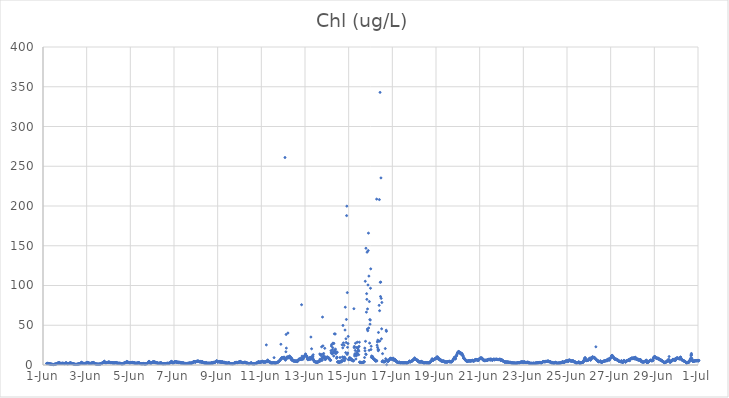
| Category | Chl (ug/L) |
|---|---|
| 45078.166666666664 | 1.92 |
| 45078.177083333336 | 1.88 |
| 45078.1875 | 1.85 |
| 45078.197916666664 | 1.78 |
| 45078.208333333336 | 1.95 |
| 45078.21875 | 2.26 |
| 45078.229166666664 | 2.01 |
| 45078.239583333336 | 1.95 |
| 45078.25 | 1.9 |
| 45078.260416666664 | 1.67 |
| 45078.270833333336 | 1.57 |
| 45078.28125 | 1.68 |
| 45078.291666666664 | 1.63 |
| 45078.302083333336 | 1.5 |
| 45078.3125 | 1.34 |
| 45078.322916666664 | 1.39 |
| 45078.333333333336 | 1.36 |
| 45078.34375 | 1.21 |
| 45078.354166666664 | 1.11 |
| 45078.364583333336 | 1.07 |
| 45078.375 | 1.02 |
| 45078.385416666664 | 0.97 |
| 45078.395833333336 | 1.02 |
| 45078.40625 | 0.93 |
| 45078.416666666664 | 0.81 |
| 45078.427083333336 | 0.87 |
| 45078.4375 | 0.68 |
| 45078.447916666664 | 0.64 |
| 45078.458333333336 | 0.58 |
| 45078.46875 | 0.56 |
| 45078.479166666664 | 0.51 |
| 45078.489583333336 | 0.64 |
| 45078.5 | 0.67 |
| 45078.510416666664 | 0.71 |
| 45078.520833333336 | 0.94 |
| 45078.53125 | 0.92 |
| 45078.541666666664 | 0.87 |
| 45078.552083333336 | 1.13 |
| 45078.5625 | 1.05 |
| 45078.572916666664 | 1 |
| 45078.583333333336 | 1.2 |
| 45078.59375 | 1.32 |
| 45078.604166666664 | 1.41 |
| 45078.614583333336 | 1.71 |
| 45078.625 | 1.72 |
| 45078.635416666664 | 1.81 |
| 45078.645833333336 | 1.87 |
| 45078.65625 | 2.12 |
| 45078.666666666664 | 2.24 |
| 45078.677083333336 | 2.17 |
| 45078.6875 | 2.4 |
| 45078.697916666664 | 2.45 |
| 45078.708333333336 | 2.29 |
| 45078.71875 | 2.29 |
| 45078.729166666664 | 2.85 |
| 45078.739583333336 | 3.1 |
| 45078.75 | 2.45 |
| 45078.760416666664 | 2.2 |
| 45078.770833333336 | 2.09 |
| 45078.78125 | 2.15 |
| 45078.791666666664 | 1.99 |
| 45078.802083333336 | 2.11 |
| 45078.8125 | 2.1 |
| 45078.822916666664 | 2.13 |
| 45078.833333333336 | 2.06 |
| 45078.84375 | 1.96 |
| 45078.854166666664 | 1.96 |
| 45078.864583333336 | 2.07 |
| 45078.875 | 2.08 |
| 45078.885416666664 | 2.19 |
| 45078.895833333336 | 2.27 |
| 45078.90625 | 2.01 |
| 45078.916666666664 | 2.1 |
| 45078.927083333336 | 1.97 |
| 45078.9375 | 2.05 |
| 45078.947916666664 | 1.94 |
| 45078.958333333336 | 2.01 |
| 45078.96875 | 1.93 |
| 45078.979166666664 | 1.87 |
| 45078.989583333336 | 1.82 |
| 45079.0 | 1.52 |
| 45079.010416666664 | 1.67 |
| 45079.020833333336 | 2.42 |
| 45079.03125 | 2.4 |
| 45079.041666666664 | 2.36 |
| 45079.052083333336 | 2.36 |
| 45079.0625 | 2.73 |
| 45079.072916666664 | 2.44 |
| 45079.083333333336 | 2.42 |
| 45079.09375 | 2.08 |
| 45079.104166666664 | 2.07 |
| 45079.114583333336 | 1.87 |
| 45079.125 | 1.61 |
| 45079.135416666664 | 1.49 |
| 45079.145833333336 | 1.64 |
| 45079.15625 | 1.82 |
| 45079.166666666664 | 1.79 |
| 45079.177083333336 | 1.87 |
| 45079.1875 | 1.8 |
| 45079.197916666664 | 1.97 |
| 45079.208333333336 | 2.15 |
| 45079.21875 | 2.15 |
| 45079.229166666664 | 2.15 |
| 45079.239583333336 | 2.58 |
| 45079.25 | 2.99 |
| 45079.260416666664 | 2.68 |
| 45079.270833333336 | 2.07 |
| 45079.28125 | 2.48 |
| 45079.291666666664 | 2.19 |
| 45079.302083333336 | 2.14 |
| 45079.3125 | 1.94 |
| 45079.322916666664 | 1.86 |
| 45079.333333333336 | 2.06 |
| 45079.34375 | 1.73 |
| 45079.354166666664 | 1.72 |
| 45079.364583333336 | 1.68 |
| 45079.375 | 1.63 |
| 45079.385416666664 | 1.44 |
| 45079.395833333336 | 1.61 |
| 45079.40625 | 1.14 |
| 45079.416666666664 | 1.22 |
| 45079.427083333336 | 1.14 |
| 45079.4375 | 1.12 |
| 45079.447916666664 | 0.95 |
| 45079.458333333336 | 0.93 |
| 45079.46875 | 0.83 |
| 45079.479166666664 | 0.75 |
| 45079.489583333336 | 0.86 |
| 45079.5 | 0.65 |
| 45079.510416666664 | 0.77 |
| 45079.520833333336 | 0.81 |
| 45079.53125 | 0.77 |
| 45079.541666666664 | 0.79 |
| 45079.552083333336 | 0.73 |
| 45079.5625 | 0.75 |
| 45079.572916666664 | 0.94 |
| 45079.583333333336 | 0.99 |
| 45079.59375 | 1.2 |
| 45079.604166666664 | 1.23 |
| 45079.614583333336 | 1.21 |
| 45079.625 | 1.17 |
| 45079.635416666664 | 1.41 |
| 45079.645833333336 | 1.51 |
| 45079.65625 | 1.63 |
| 45079.666666666664 | 1.53 |
| 45079.677083333336 | 1.55 |
| 45079.6875 | 1.6 |
| 45079.697916666664 | 1.94 |
| 45079.708333333336 | 1.96 |
| 45079.71875 | 1.65 |
| 45079.729166666664 | 2.15 |
| 45079.739583333336 | 2.71 |
| 45079.75 | 2.74 |
| 45079.760416666664 | 3.48 |
| 45079.770833333336 | 3.11 |
| 45079.78125 | 2.45 |
| 45079.791666666664 | 2.18 |
| 45079.802083333336 | 2.28 |
| 45079.8125 | 2.07 |
| 45079.822916666664 | 2.18 |
| 45079.833333333336 | 2.21 |
| 45079.84375 | 1.96 |
| 45079.854166666664 | 2.02 |
| 45079.864583333336 | 1.98 |
| 45079.875 | 1.91 |
| 45079.885416666664 | 1.8 |
| 45079.895833333336 | 1.9 |
| 45079.90625 | 1.88 |
| 45079.916666666664 | 2.01 |
| 45079.927083333336 | 1.74 |
| 45079.9375 | 2.04 |
| 45079.947916666664 | 1.87 |
| 45079.958333333336 | 2.32 |
| 45079.96875 | 2.3 |
| 45079.979166666664 | 2.29 |
| 45079.989583333336 | 2.88 |
| 45080.0 | 2.75 |
| 45080.010416666664 | 2.42 |
| 45080.020833333336 | 2.59 |
| 45080.03125 | 2.84 |
| 45080.041666666664 | 3.31 |
| 45080.052083333336 | 2.75 |
| 45080.0625 | 2.86 |
| 45080.072916666664 | 2.59 |
| 45080.083333333336 | 2.69 |
| 45080.09375 | 2.25 |
| 45080.104166666664 | 2.3 |
| 45080.114583333336 | 2.24 |
| 45080.125 | 2.17 |
| 45080.135416666664 | 2.17 |
| 45080.145833333336 | 1.88 |
| 45080.15625 | 1.8 |
| 45080.166666666664 | 2.04 |
| 45080.177083333336 | 2 |
| 45080.1875 | 1.93 |
| 45080.197916666664 | 2.06 |
| 45080.208333333336 | 2.33 |
| 45080.21875 | 2.32 |
| 45080.229166666664 | 2.58 |
| 45080.239583333336 | 2.55 |
| 45080.25 | 2.32 |
| 45080.260416666664 | 2.47 |
| 45080.270833333336 | 2.6 |
| 45080.28125 | 2.76 |
| 45080.291666666664 | 3.4 |
| 45080.302083333336 | 3.24 |
| 45080.3125 | 2.74 |
| 45080.322916666664 | 2.8 |
| 45080.333333333336 | 2.72 |
| 45080.34375 | 2.33 |
| 45080.354166666664 | 1.97 |
| 45080.364583333336 | 1.82 |
| 45080.375 | 1.96 |
| 45080.385416666664 | 1.79 |
| 45080.395833333336 | 1.74 |
| 45080.40625 | 1.65 |
| 45080.416666666664 | 1.29 |
| 45080.427083333336 | 1.31 |
| 45080.4375 | 1.19 |
| 45080.447916666664 | 1.07 |
| 45080.458333333336 | 1.24 |
| 45080.46875 | 1.05 |
| 45080.479166666664 | 1.07 |
| 45080.489583333336 | 1.05 |
| 45080.5 | 1.03 |
| 45080.510416666664 | 0.98 |
| 45080.520833333336 | 1.01 |
| 45080.53125 | 0.98 |
| 45080.541666666664 | 0.8 |
| 45080.552083333336 | 1.04 |
| 45080.5625 | 1.12 |
| 45080.572916666664 | 1.08 |
| 45080.583333333336 | 1.11 |
| 45080.59375 | 1.08 |
| 45080.604166666664 | 1.26 |
| 45080.614583333336 | 1.16 |
| 45080.625 | 1.32 |
| 45080.635416666664 | 1.34 |
| 45080.645833333336 | 1.48 |
| 45080.65625 | 1.7 |
| 45080.666666666664 | 1.97 |
| 45080.677083333336 | 1.85 |
| 45080.6875 | 2 |
| 45080.697916666664 | 2.28 |
| 45080.708333333336 | 2.31 |
| 45080.71875 | 2.5 |
| 45080.729166666664 | 2.66 |
| 45080.739583333336 | 3.03 |
| 45080.75 | 3.27 |
| 45080.760416666664 | 3.28 |
| 45080.770833333336 | 3.42 |
| 45080.78125 | 3.34 |
| 45080.791666666664 | 3.48 |
| 45080.802083333336 | 4.09 |
| 45080.8125 | 4.83 |
| 45080.822916666664 | 3.67 |
| 45080.833333333336 | 3.06 |
| 45080.84375 | 3.38 |
| 45080.854166666664 | 3.23 |
| 45080.864583333336 | 2.92 |
| 45080.875 | 2.84 |
| 45080.885416666664 | 2.89 |
| 45080.895833333336 | 2.89 |
| 45080.90625 | 3.01 |
| 45080.916666666664 | 3.08 |
| 45080.927083333336 | 3.18 |
| 45080.9375 | 3.28 |
| 45080.947916666664 | 3.19 |
| 45080.958333333336 | 3.17 |
| 45080.96875 | 3.28 |
| 45080.979166666664 | 3.47 |
| 45080.989583333336 | 3.53 |
| 45081.0 | 3.52 |
| 45081.010416666664 | 3.74 |
| 45081.020833333336 | 3.61 |
| 45081.03125 | 3.43 |
| 45081.041666666664 | 3.51 |
| 45081.052083333336 | 3.27 |
| 45081.0625 | 3.45 |
| 45081.072916666664 | 3.33 |
| 45081.083333333336 | 3.07 |
| 45081.09375 | 2.87 |
| 45081.104166666664 | 2.94 |
| 45081.114583333336 | 2.95 |
| 45081.125 | 3.03 |
| 45081.135416666664 | 3.08 |
| 45081.145833333336 | 2.95 |
| 45081.15625 | 2.95 |
| 45081.166666666664 | 2.72 |
| 45081.177083333336 | 2.71 |
| 45081.1875 | 2.72 |
| 45081.197916666664 | 2.75 |
| 45081.208333333336 | 2.8 |
| 45081.21875 | 2.79 |
| 45081.229166666664 | 2.57 |
| 45081.239583333336 | 2.56 |
| 45081.25 | 2.75 |
| 45081.260416666664 | 2.56 |
| 45081.270833333336 | 2.67 |
| 45081.28125 | 2.58 |
| 45081.291666666664 | 2.72 |
| 45081.302083333336 | 2.81 |
| 45081.3125 | 2.76 |
| 45081.322916666664 | 2.86 |
| 45081.333333333336 | 2.96 |
| 45081.34375 | 2.82 |
| 45081.354166666664 | 3.09 |
| 45081.364583333336 | 2.82 |
| 45081.375 | 2.38 |
| 45081.385416666664 | 2.52 |
| 45081.395833333336 | 2.48 |
| 45081.40625 | 2.47 |
| 45081.416666666664 | 2.29 |
| 45081.427083333336 | 2.31 |
| 45081.4375 | 2.15 |
| 45081.447916666664 | 2.15 |
| 45081.458333333336 | 1.97 |
| 45081.46875 | 2.17 |
| 45081.479166666664 | 2.05 |
| 45081.489583333336 | 2.31 |
| 45081.5 | 2.16 |
| 45081.510416666664 | 2.03 |
| 45081.520833333336 | 1.96 |
| 45081.53125 | 2.08 |
| 45081.541666666664 | 2.03 |
| 45081.552083333336 | 2.02 |
| 45081.5625 | 1.84 |
| 45081.572916666664 | 1.85 |
| 45081.583333333336 | 1.73 |
| 45081.59375 | 1.76 |
| 45081.604166666664 | 1.65 |
| 45081.614583333336 | 1.29 |
| 45081.625 | 1.32 |
| 45081.635416666664 | 1.69 |
| 45081.645833333336 | 1.88 |
| 45081.65625 | 1.67 |
| 45081.666666666664 | 1.83 |
| 45081.677083333336 | 1.56 |
| 45081.6875 | 1.94 |
| 45081.697916666664 | 2.28 |
| 45081.708333333336 | 2.25 |
| 45081.71875 | 2.53 |
| 45081.729166666664 | 2.41 |
| 45081.739583333336 | 2.6 |
| 45081.75 | 2.75 |
| 45081.760416666664 | 2.87 |
| 45081.770833333336 | 3 |
| 45081.78125 | 3.11 |
| 45081.791666666664 | 3.05 |
| 45081.802083333336 | 3.48 |
| 45081.8125 | 3.23 |
| 45081.822916666664 | 3.83 |
| 45081.833333333336 | 4.47 |
| 45081.84375 | 3.79 |
| 45081.854166666664 | 3.72 |
| 45081.864583333336 | 3.83 |
| 45081.875 | 3.62 |
| 45081.885416666664 | 3.68 |
| 45081.895833333336 | 3.27 |
| 45081.90625 | 3.07 |
| 45081.916666666664 | 3.29 |
| 45081.927083333336 | 3.19 |
| 45081.9375 | 3.1 |
| 45081.947916666664 | 3.03 |
| 45081.958333333336 | 2.87 |
| 45081.96875 | 2.83 |
| 45081.979166666664 | 2.7 |
| 45081.989583333336 | 2.84 |
| 45082.0 | 2.89 |
| 45082.010416666664 | 3.06 |
| 45082.020833333336 | 2.97 |
| 45082.03125 | 3.26 |
| 45082.041666666664 | 3.17 |
| 45082.052083333336 | 3.03 |
| 45082.0625 | 3.04 |
| 45082.072916666664 | 3.24 |
| 45082.083333333336 | 2.85 |
| 45082.09375 | 3.12 |
| 45082.104166666664 | 3.37 |
| 45082.114583333336 | 2.91 |
| 45082.125 | 2.68 |
| 45082.135416666664 | 2.9 |
| 45082.145833333336 | 2.93 |
| 45082.15625 | 2.92 |
| 45082.166666666664 | 2.82 |
| 45082.177083333336 | 2.72 |
| 45082.1875 | 2.77 |
| 45082.197916666664 | 2.54 |
| 45082.208333333336 | 2.38 |
| 45082.21875 | 2.24 |
| 45082.229166666664 | 2.11 |
| 45082.239583333336 | 2.11 |
| 45082.25 | 2.27 |
| 45082.260416666664 | 2.14 |
| 45082.270833333336 | 2.26 |
| 45082.28125 | 1.97 |
| 45082.291666666664 | 2.2 |
| 45082.302083333336 | 2.41 |
| 45082.3125 | 2.38 |
| 45082.322916666664 | 2.35 |
| 45082.333333333336 | 2.46 |
| 45082.34375 | 2.52 |
| 45082.354166666664 | 2.52 |
| 45082.364583333336 | 2.71 |
| 45082.375 | 2.91 |
| 45082.385416666664 | 2.56 |
| 45082.395833333336 | 2.93 |
| 45082.40625 | 2.42 |
| 45082.416666666664 | 2.45 |
| 45082.427083333336 | 2.26 |
| 45082.4375 | 2.14 |
| 45082.447916666664 | 1.9 |
| 45082.458333333336 | 1.73 |
| 45082.46875 | 1.73 |
| 45082.479166666664 | 1.71 |
| 45082.489583333336 | 1.61 |
| 45082.5 | 1.63 |
| 45082.510416666664 | 1.51 |
| 45082.520833333336 | 1.6 |
| 45082.53125 | 1.68 |
| 45082.541666666664 | 1.56 |
| 45082.552083333336 | 1.6 |
| 45082.5625 | 1.49 |
| 45082.572916666664 | 1.76 |
| 45082.583333333336 | 1.5 |
| 45082.59375 | 1.95 |
| 45082.604166666664 | 1.94 |
| 45082.614583333336 | 1.44 |
| 45082.625 | 1.53 |
| 45082.635416666664 | 1.44 |
| 45082.645833333336 | 1.3 |
| 45082.65625 | 1.37 |
| 45082.666666666664 | 1.31 |
| 45082.677083333336 | 1.37 |
| 45082.6875 | 1.06 |
| 45082.697916666664 | 1.53 |
| 45082.708333333336 | 1.3 |
| 45082.71875 | 1.57 |
| 45082.729166666664 | 1.51 |
| 45082.739583333336 | 1.71 |
| 45082.75 | 1.69 |
| 45082.760416666664 | 1.99 |
| 45082.770833333336 | 1.92 |
| 45082.78125 | 2.2 |
| 45082.791666666664 | 2.36 |
| 45082.802083333336 | 2.52 |
| 45082.8125 | 2.64 |
| 45082.822916666664 | 3.25 |
| 45082.833333333336 | 3.52 |
| 45082.84375 | 4.13 |
| 45082.854166666664 | 4.66 |
| 45082.864583333336 | 4.53 |
| 45082.875 | 3.1 |
| 45082.885416666664 | 2.9 |
| 45082.895833333336 | 2.66 |
| 45082.90625 | 2.55 |
| 45082.916666666664 | 2.63 |
| 45082.927083333336 | 2.56 |
| 45082.9375 | 2.43 |
| 45082.947916666664 | 2.65 |
| 45082.958333333336 | 2.52 |
| 45082.96875 | 2.78 |
| 45082.979166666664 | 2.76 |
| 45082.989583333336 | 2.86 |
| 45083.0 | 3.26 |
| 45083.010416666664 | 3.34 |
| 45083.020833333336 | 3.5 |
| 45083.03125 | 3.53 |
| 45083.041666666664 | 3.86 |
| 45083.052083333336 | 4.31 |
| 45083.0625 | 3.48 |
| 45083.072916666664 | 3.37 |
| 45083.083333333336 | 3.53 |
| 45083.09375 | 4.09 |
| 45083.104166666664 | 3.94 |
| 45083.114583333336 | 3.57 |
| 45083.125 | 2.91 |
| 45083.135416666664 | 3.43 |
| 45083.145833333336 | 3.42 |
| 45083.15625 | 3.17 |
| 45083.166666666664 | 2.58 |
| 45083.177083333336 | 2.76 |
| 45083.1875 | 2.88 |
| 45083.197916666664 | 2.87 |
| 45083.208333333336 | 2.77 |
| 45083.21875 | 2.68 |
| 45083.229166666664 | 2.83 |
| 45083.239583333336 | 2.47 |
| 45083.25 | 2.66 |
| 45083.260416666664 | 2.1 |
| 45083.270833333336 | 1.9 |
| 45083.28125 | 2.04 |
| 45083.291666666664 | 2.06 |
| 45083.302083333336 | 2.14 |
| 45083.3125 | 2.16 |
| 45083.322916666664 | 2.2 |
| 45083.333333333336 | 2.32 |
| 45083.34375 | 2.28 |
| 45083.354166666664 | 2.29 |
| 45083.364583333336 | 2.39 |
| 45083.375 | 2.31 |
| 45083.385416666664 | 2.39 |
| 45083.395833333336 | 2.78 |
| 45083.40625 | 3.04 |
| 45083.416666666664 | 2.1 |
| 45083.427083333336 | 1.97 |
| 45083.4375 | 2.04 |
| 45083.447916666664 | 1.89 |
| 45083.458333333336 | 1.85 |
| 45083.46875 | 1.75 |
| 45083.479166666664 | 1.59 |
| 45083.489583333336 | 1.68 |
| 45083.5 | 1.61 |
| 45083.510416666664 | 1.63 |
| 45083.520833333336 | 1.67 |
| 45083.53125 | 1.64 |
| 45083.541666666664 | 1.59 |
| 45083.552083333336 | 1.62 |
| 45083.5625 | 1.76 |
| 45083.572916666664 | 1.75 |
| 45083.583333333336 | 1.87 |
| 45083.59375 | 1.66 |
| 45083.604166666664 | 1.75 |
| 45083.614583333336 | 1.78 |
| 45083.625 | 1.57 |
| 45083.635416666664 | 1.85 |
| 45083.645833333336 | 1.98 |
| 45083.65625 | 1.91 |
| 45083.666666666664 | 1.93 |
| 45083.677083333336 | 2.06 |
| 45083.6875 | 1.83 |
| 45083.697916666664 | 2.35 |
| 45083.708333333336 | 2.06 |
| 45083.71875 | 2.04 |
| 45083.729166666664 | 1.93 |
| 45083.739583333336 | 1.86 |
| 45083.75 | 2.08 |
| 45083.760416666664 | 2.14 |
| 45083.770833333336 | 2.04 |
| 45083.78125 | 2.17 |
| 45083.791666666664 | 2.2 |
| 45083.802083333336 | 2.58 |
| 45083.8125 | 2.68 |
| 45083.822916666664 | 2.88 |
| 45083.833333333336 | 3.01 |
| 45083.84375 | 3.14 |
| 45083.854166666664 | 3.87 |
| 45083.864583333336 | 3.6 |
| 45083.875 | 4.28 |
| 45083.885416666664 | 4.56 |
| 45083.895833333336 | 4.42 |
| 45083.90625 | 3.51 |
| 45083.916666666664 | 3.03 |
| 45083.927083333336 | 2.69 |
| 45083.9375 | 2.81 |
| 45083.947916666664 | 2.94 |
| 45083.958333333336 | 2.95 |
| 45083.96875 | 2.76 |
| 45083.979166666664 | 2.89 |
| 45083.989583333336 | 3.12 |
| 45084.0 | 3.42 |
| 45084.010416666664 | 3.68 |
| 45084.020833333336 | 3.85 |
| 45084.03125 | 3.92 |
| 45084.041666666664 | 4.15 |
| 45084.052083333336 | 4.16 |
| 45084.0625 | 3.87 |
| 45084.072916666664 | 3.89 |
| 45084.083333333336 | 3.95 |
| 45084.09375 | 3.76 |
| 45084.104166666664 | 4.19 |
| 45084.114583333336 | 4.13 |
| 45084.125 | 3.38 |
| 45084.135416666664 | 3.09 |
| 45084.145833333336 | 3.52 |
| 45084.15625 | 3.18 |
| 45084.166666666664 | 3.15 |
| 45084.177083333336 | 3.84 |
| 45084.1875 | 3.88 |
| 45084.197916666664 | 2.99 |
| 45084.208333333336 | 2.98 |
| 45084.21875 | 3.22 |
| 45084.229166666664 | 3.12 |
| 45084.239583333336 | 3.44 |
| 45084.25 | 2.97 |
| 45084.260416666664 | 3.2 |
| 45084.270833333336 | 3.5 |
| 45084.28125 | 3.3 |
| 45084.291666666664 | 2.75 |
| 45084.302083333336 | 2.58 |
| 45084.3125 | 3.15 |
| 45084.322916666664 | 2.51 |
| 45084.333333333336 | 2.45 |
| 45084.34375 | 2.62 |
| 45084.354166666664 | 2.56 |
| 45084.364583333336 | 2.85 |
| 45084.375 | 2.63 |
| 45084.385416666664 | 2.61 |
| 45084.395833333336 | 2.48 |
| 45084.40625 | 2.36 |
| 45084.416666666664 | 2.3 |
| 45084.427083333336 | 2.18 |
| 45084.4375 | 2.96 |
| 45084.447916666664 | 2.15 |
| 45084.458333333336 | 2.07 |
| 45084.46875 | 1.94 |
| 45084.479166666664 | 1.89 |
| 45084.489583333336 | 1.92 |
| 45084.5 | 1.88 |
| 45084.510416666664 | 2.08 |
| 45084.520833333336 | 1.85 |
| 45084.53125 | 1.85 |
| 45084.541666666664 | 1.93 |
| 45084.552083333336 | 1.83 |
| 45084.5625 | 1.8 |
| 45084.572916666664 | 1.88 |
| 45084.583333333336 | 1.94 |
| 45084.59375 | 1.84 |
| 45084.604166666664 | 1.96 |
| 45084.614583333336 | 1.89 |
| 45084.625 | 2.08 |
| 45084.635416666664 | 1.95 |
| 45084.645833333336 | 2.03 |
| 45084.65625 | 1.95 |
| 45084.666666666664 | 2.21 |
| 45084.677083333336 | 2.2 |
| 45084.6875 | 2.21 |
| 45084.697916666664 | 2.59 |
| 45084.708333333336 | 2.35 |
| 45084.71875 | 2.34 |
| 45084.729166666664 | 2.44 |
| 45084.739583333336 | 2.34 |
| 45084.75 | 2.13 |
| 45084.760416666664 | 2.44 |
| 45084.770833333336 | 2.33 |
| 45084.78125 | 2.52 |
| 45084.791666666664 | 2.23 |
| 45084.802083333336 | 2.2 |
| 45084.8125 | 2.17 |
| 45084.822916666664 | 2.69 |
| 45084.833333333336 | 2.9 |
| 45084.84375 | 2.9 |
| 45084.854166666664 | 3.38 |
| 45084.864583333336 | 3.31 |
| 45084.875 | 3.21 |
| 45084.885416666664 | 3.49 |
| 45084.895833333336 | 4.15 |
| 45084.90625 | 4.3 |
| 45084.916666666664 | 4.34 |
| 45084.927083333336 | 4.32 |
| 45084.9375 | 4.24 |
| 45084.947916666664 | 4.17 |
| 45084.958333333336 | 3.69 |
| 45084.96875 | 3.59 |
| 45084.979166666664 | 3.64 |
| 45084.989583333336 | 3.81 |
| 45085.0 | 3.98 |
| 45085.010416666664 | 4.13 |
| 45085.020833333336 | 4.48 |
| 45085.03125 | 4.47 |
| 45085.041666666664 | 4.62 |
| 45085.052083333336 | 4.65 |
| 45085.0625 | 4.26 |
| 45085.072916666664 | 5.05 |
| 45085.083333333336 | 4.63 |
| 45085.09375 | 5.01 |
| 45085.104166666664 | 5.07 |
| 45085.114583333336 | 4.32 |
| 45085.125 | 4.53 |
| 45085.135416666664 | 4.78 |
| 45085.145833333336 | 4.73 |
| 45085.15625 | 4.17 |
| 45085.166666666664 | 4.06 |
| 45085.177083333336 | 4.01 |
| 45085.1875 | 4.14 |
| 45085.197916666664 | 4.48 |
| 45085.208333333336 | 4.47 |
| 45085.21875 | 4.01 |
| 45085.229166666664 | 3.85 |
| 45085.239583333336 | 3.79 |
| 45085.25 | 3.4 |
| 45085.260416666664 | 3.5 |
| 45085.270833333336 | 3.93 |
| 45085.28125 | 4.33 |
| 45085.291666666664 | 4.11 |
| 45085.302083333336 | 4.1 |
| 45085.3125 | 3.98 |
| 45085.322916666664 | 3.34 |
| 45085.333333333336 | 3.05 |
| 45085.34375 | 3.25 |
| 45085.354166666664 | 3.06 |
| 45085.364583333336 | 2.82 |
| 45085.375 | 2.65 |
| 45085.385416666664 | 2.79 |
| 45085.395833333336 | 2.79 |
| 45085.40625 | 2.62 |
| 45085.416666666664 | 2.56 |
| 45085.427083333336 | 2.49 |
| 45085.4375 | 2.47 |
| 45085.447916666664 | 2.31 |
| 45085.458333333336 | 2.64 |
| 45085.46875 | 3.13 |
| 45085.479166666664 | 2.82 |
| 45085.489583333336 | 2.15 |
| 45085.5 | 2.51 |
| 45085.510416666664 | 2.15 |
| 45085.520833333336 | 2.19 |
| 45085.53125 | 2.16 |
| 45085.541666666664 | 2.27 |
| 45085.552083333336 | 2.1 |
| 45085.5625 | 2.13 |
| 45085.572916666664 | 2.13 |
| 45085.583333333336 | 2.17 |
| 45085.59375 | 2.31 |
| 45085.604166666664 | 2.2 |
| 45085.614583333336 | 2.33 |
| 45085.625 | 2.27 |
| 45085.635416666664 | 1.93 |
| 45085.645833333336 | 2.05 |
| 45085.65625 | 2.19 |
| 45085.666666666664 | 2.13 |
| 45085.677083333336 | 2.26 |
| 45085.6875 | 2.25 |
| 45085.697916666664 | 2.21 |
| 45085.708333333336 | 2.45 |
| 45085.71875 | 2.92 |
| 45085.729166666664 | 2.78 |
| 45085.739583333336 | 2.87 |
| 45085.75 | 2.65 |
| 45085.760416666664 | 2.35 |
| 45085.770833333336 | 2.4 |
| 45085.78125 | 2.59 |
| 45085.791666666664 | 2.57 |
| 45085.802083333336 | 2.92 |
| 45085.8125 | 3.36 |
| 45085.822916666664 | 3.13 |
| 45085.833333333336 | 3.15 |
| 45085.84375 | 3.05 |
| 45085.854166666664 | 3.1 |
| 45085.864583333336 | 3.26 |
| 45085.875 | 3.41 |
| 45085.885416666664 | 3.81 |
| 45085.895833333336 | 4.1 |
| 45085.90625 | 4.08 |
| 45085.916666666664 | 4.49 |
| 45085.927083333336 | 4.28 |
| 45085.9375 | 4.79 |
| 45085.947916666664 | 4.74 |
| 45085.958333333336 | 5.5 |
| 45085.96875 | 4.3 |
| 45085.979166666664 | 4.14 |
| 45085.989583333336 | 3.96 |
| 45086.0 | 3.6 |
| 45086.010416666664 | 3.88 |
| 45086.020833333336 | 4.08 |
| 45086.03125 | 4.29 |
| 45086.041666666664 | 4.19 |
| 45086.052083333336 | 4.08 |
| 45086.0625 | 4.01 |
| 45086.072916666664 | 4.03 |
| 45086.083333333336 | 3.68 |
| 45086.09375 | 4.51 |
| 45086.104166666664 | 3.66 |
| 45086.114583333336 | 3.79 |
| 45086.125 | 3.7 |
| 45086.135416666664 | 3.61 |
| 45086.145833333336 | 4.4 |
| 45086.15625 | 3.57 |
| 45086.166666666664 | 3.46 |
| 45086.177083333336 | 3.47 |
| 45086.1875 | 3.41 |
| 45086.197916666664 | 4.1 |
| 45086.208333333336 | 3.72 |
| 45086.21875 | 3.75 |
| 45086.229166666664 | 3.72 |
| 45086.239583333336 | 3.86 |
| 45086.25 | 3.46 |
| 45086.260416666664 | 2.98 |
| 45086.270833333336 | 3.16 |
| 45086.28125 | 3.2 |
| 45086.291666666664 | 3.2 |
| 45086.302083333336 | 3.45 |
| 45086.3125 | 2.63 |
| 45086.322916666664 | 3.07 |
| 45086.333333333336 | 3.45 |
| 45086.34375 | 2.57 |
| 45086.354166666664 | 2.58 |
| 45086.364583333336 | 2.36 |
| 45086.375 | 2.58 |
| 45086.385416666664 | 2.76 |
| 45086.395833333336 | 2.72 |
| 45086.40625 | 2.28 |
| 45086.416666666664 | 1.93 |
| 45086.427083333336 | 1.85 |
| 45086.4375 | 2.14 |
| 45086.447916666664 | 2.12 |
| 45086.458333333336 | 2.34 |
| 45086.46875 | 2.36 |
| 45086.479166666664 | 2.54 |
| 45086.489583333336 | 2.59 |
| 45086.5 | 2.78 |
| 45086.510416666664 | 3.07 |
| 45086.520833333336 | 2.66 |
| 45086.53125 | 2.43 |
| 45086.541666666664 | 2.05 |
| 45086.552083333336 | 2.09 |
| 45086.5625 | 1.97 |
| 45086.572916666664 | 1.94 |
| 45086.583333333336 | 1.84 |
| 45086.59375 | 1.76 |
| 45086.604166666664 | 1.6 |
| 45086.614583333336 | 1.58 |
| 45086.625 | 1.76 |
| 45086.635416666664 | 1.77 |
| 45086.645833333336 | 1.67 |
| 45086.65625 | 1.67 |
| 45086.666666666664 | 1.53 |
| 45086.677083333336 | 1.61 |
| 45086.6875 | 1.75 |
| 45086.697916666664 | 1.67 |
| 45086.708333333336 | 1.74 |
| 45086.71875 | 1.73 |
| 45086.729166666664 | 1.78 |
| 45086.739583333336 | 1.72 |
| 45086.75 | 2.11 |
| 45086.760416666664 | 2.48 |
| 45086.770833333336 | 2.64 |
| 45086.78125 | 2.89 |
| 45086.791666666664 | 2.73 |
| 45086.802083333336 | 2.46 |
| 45086.8125 | 2.66 |
| 45086.822916666664 | 3.21 |
| 45086.833333333336 | 3.08 |
| 45086.84375 | 3.36 |
| 45086.854166666664 | 3.17 |
| 45086.864583333336 | 3.25 |
| 45086.875 | 3.07 |
| 45086.885416666664 | 2.69 |
| 45086.895833333336 | 2.82 |
| 45086.90625 | 3.18 |
| 45086.916666666664 | 2.97 |
| 45086.927083333336 | 3.1 |
| 45086.9375 | 3.21 |
| 45086.947916666664 | 3.33 |
| 45086.958333333336 | 3.42 |
| 45086.96875 | 3.64 |
| 45086.979166666664 | 3.39 |
| 45086.989583333336 | 3.51 |
| 45087.0 | 4.33 |
| 45087.010416666664 | 3.94 |
| 45087.020833333336 | 3.72 |
| 45087.03125 | 4.59 |
| 45087.041666666664 | 3.92 |
| 45087.052083333336 | 4.26 |
| 45087.0625 | 3.56 |
| 45087.072916666664 | 3.67 |
| 45087.083333333336 | 3.32 |
| 45087.09375 | 3.29 |
| 45087.104166666664 | 3.05 |
| 45087.114583333336 | 3.36 |
| 45087.125 | 3.22 |
| 45087.135416666664 | 3.13 |
| 45087.145833333336 | 2.9 |
| 45087.15625 | 2.69 |
| 45087.166666666664 | 2.96 |
| 45087.177083333336 | 2.88 |
| 45087.1875 | 3.08 |
| 45087.197916666664 | 3.22 |
| 45087.208333333336 | 3.24 |
| 45087.21875 | 3.42 |
| 45087.229166666664 | 3.16 |
| 45087.239583333336 | 3.46 |
| 45087.25 | 2.99 |
| 45087.260416666664 | 3.37 |
| 45087.270833333336 | 2.81 |
| 45087.28125 | 3.4 |
| 45087.291666666664 | 2.9 |
| 45087.302083333336 | 2.76 |
| 45087.3125 | 2.68 |
| 45087.322916666664 | 2.34 |
| 45087.333333333336 | 2.41 |
| 45087.34375 | 2.58 |
| 45087.354166666664 | 2.12 |
| 45087.364583333336 | 2.37 |
| 45087.375 | 2.05 |
| 45087.385416666664 | 2.23 |
| 45087.395833333336 | 2.1 |
| 45087.40625 | 1.63 |
| 45087.416666666664 | 1.63 |
| 45087.427083333336 | 1.88 |
| 45087.4375 | 1.63 |
| 45087.447916666664 | 1.69 |
| 45087.458333333336 | 1.61 |
| 45087.46875 | 1.95 |
| 45087.479166666664 | 1.98 |
| 45087.489583333336 | 2 |
| 45087.5 | 2.1 |
| 45087.510416666664 | 2.24 |
| 45087.520833333336 | 2.31 |
| 45087.53125 | 2.48 |
| 45087.541666666664 | 3.03 |
| 45087.552083333336 | 2.29 |
| 45087.5625 | 1.96 |
| 45087.572916666664 | 1.9 |
| 45087.583333333336 | 1.65 |
| 45087.59375 | 1.58 |
| 45087.604166666664 | 1.56 |
| 45087.614583333336 | 1.63 |
| 45087.625 | 1.63 |
| 45087.635416666664 | 1.55 |
| 45087.645833333336 | 1.39 |
| 45087.65625 | 1.54 |
| 45087.666666666664 | 1.48 |
| 45087.677083333336 | 1.49 |
| 45087.6875 | 1.45 |
| 45087.697916666664 | 1.54 |
| 45087.708333333336 | 1.58 |
| 45087.71875 | 1.75 |
| 45087.729166666664 | 1.94 |
| 45087.739583333336 | 2.1 |
| 45087.75 | 1.81 |
| 45087.760416666664 | 2.04 |
| 45087.770833333336 | 1.92 |
| 45087.78125 | 2.29 |
| 45087.791666666664 | 2.7 |
| 45087.802083333336 | 2.62 |
| 45087.8125 | 2.97 |
| 45087.822916666664 | 2.78 |
| 45087.833333333336 | 3.43 |
| 45087.84375 | 2.9 |
| 45087.854166666664 | 3.13 |
| 45087.864583333336 | 4.19 |
| 45087.875 | 3.72 |
| 45087.885416666664 | 4.08 |
| 45087.895833333336 | 3.82 |
| 45087.90625 | 3.44 |
| 45087.916666666664 | 3.24 |
| 45087.927083333336 | 3.42 |
| 45087.9375 | 3.36 |
| 45087.947916666664 | 3.51 |
| 45087.958333333336 | 3.62 |
| 45087.96875 | 3.77 |
| 45087.979166666664 | 3.84 |
| 45087.989583333336 | 3.94 |
| 45088.0 | 3.92 |
| 45088.010416666664 | 3.98 |
| 45088.020833333336 | 4.11 |
| 45088.03125 | 4.35 |
| 45088.041666666664 | 4.64 |
| 45088.052083333336 | 4.68 |
| 45088.0625 | 3.84 |
| 45088.072916666664 | 4.12 |
| 45088.083333333336 | 3.79 |
| 45088.09375 | 3.79 |
| 45088.104166666664 | 3.6 |
| 45088.114583333336 | 3.76 |
| 45088.125 | 3.66 |
| 45088.135416666664 | 3.8 |
| 45088.145833333336 | 3.77 |
| 45088.15625 | 3.71 |
| 45088.166666666664 | 4.1 |
| 45088.177083333336 | 3.64 |
| 45088.1875 | 3.71 |
| 45088.197916666664 | 3.76 |
| 45088.208333333336 | 4.01 |
| 45088.21875 | 4.16 |
| 45088.229166666664 | 25.26 |
| 45088.239583333336 | 4.12 |
| 45088.25 | 5.06 |
| 45088.260416666664 | 4.42 |
| 45088.270833333336 | 4.01 |
| 45088.28125 | 4.99 |
| 45088.291666666664 | 6.32 |
| 45088.302083333336 | 4.96 |
| 45088.3125 | 4.83 |
| 45088.322916666664 | 4.31 |
| 45088.333333333336 | 4.16 |
| 45088.34375 | 4.37 |
| 45088.354166666664 | 4.04 |
| 45088.364583333336 | 4.07 |
| 45088.375 | 3.94 |
| 45088.385416666664 | 4.15 |
| 45088.395833333336 | 3.73 |
| 45088.40625 | 3.42 |
| 45088.416666666664 | 3.2 |
| 45088.427083333336 | 2.63 |
| 45088.4375 | 2.78 |
| 45088.447916666664 | 2.65 |
| 45088.458333333336 | 2.45 |
| 45088.46875 | 2.34 |
| 45088.479166666664 | 2.51 |
| 45088.489583333336 | 2.51 |
| 45088.5 | 2.62 |
| 45088.510416666664 | 2.55 |
| 45088.520833333336 | 2.78 |
| 45088.53125 | 2.7 |
| 45088.541666666664 | 2.66 |
| 45088.552083333336 | 2.68 |
| 45088.5625 | 2.86 |
| 45088.572916666664 | 3.01 |
| 45088.583333333336 | 9.25 |
| 45088.59375 | 3.02 |
| 45088.604166666664 | 2.47 |
| 45088.614583333336 | 2.36 |
| 45088.625 | 2.35 |
| 45088.635416666664 | 2.23 |
| 45088.645833333336 | 2.09 |
| 45088.65625 | 2.42 |
| 45088.666666666664 | 2.89 |
| 45088.677083333336 | 2.67 |
| 45088.6875 | 2.93 |
| 45088.697916666664 | 2.8 |
| 45088.708333333336 | 3.02 |
| 45088.71875 | 3.05 |
| 45088.729166666664 | 3.15 |
| 45088.739583333336 | 3.21 |
| 45088.75 | 3.34 |
| 45088.760416666664 | 3.77 |
| 45088.770833333336 | 3.66 |
| 45088.78125 | 4.15 |
| 45088.791666666664 | 4.36 |
| 45088.802083333336 | 4.45 |
| 45088.8125 | 4.97 |
| 45088.822916666664 | 5.09 |
| 45088.833333333336 | 5.46 |
| 45088.84375 | 5.46 |
| 45088.854166666664 | 6.36 |
| 45088.864583333336 | 6.21 |
| 45088.875 | 6.41 |
| 45088.885416666664 | 7.3 |
| 45088.895833333336 | 26.1 |
| 45088.90625 | 8.33 |
| 45088.916666666664 | 8.25 |
| 45088.927083333336 | 9.15 |
| 45088.9375 | 8.99 |
| 45088.947916666664 | 9.19 |
| 45088.958333333336 | 8.64 |
| 45088.96875 | 9.06 |
| 45088.979166666664 | 8.63 |
| 45088.989583333336 | 9.04 |
| 45089.0 | 8.91 |
| 45089.010416666664 | 8.94 |
| 45089.020833333336 | 9.2 |
| 45089.03125 | 9.57 |
| 45089.041666666664 | 10 |
| 45089.052083333336 | 8.58 |
| 45089.0625 | 7.92 |
| 45089.072916666664 | 7.6 |
| 45089.083333333336 | 260.98 |
| 45089.09375 | 7.85 |
| 45089.104166666664 | 6.02 |
| 45089.114583333336 | 7.83 |
| 45089.125 | 16.63 |
| 45089.135416666664 | 38.41 |
| 45089.145833333336 | 21.23 |
| 45089.15625 | 7.69 |
| 45089.166666666664 | 9.62 |
| 45089.177083333336 | 10.1 |
| 45089.1875 | 9.6 |
| 45089.197916666664 | 10.23 |
| 45089.208333333336 | 9.6 |
| 45089.21875 | 40.23 |
| 45089.229166666664 | 9.25 |
| 45089.239583333336 | 9.8 |
| 45089.25 | 9.03 |
| 45089.260416666664 | 10.08 |
| 45089.270833333336 | 10.31 |
| 45089.28125 | 9.64 |
| 45089.291666666664 | 11.43 |
| 45089.302083333336 | 10.06 |
| 45089.3125 | 9.48 |
| 45089.322916666664 | 8.84 |
| 45089.333333333336 | 10.14 |
| 45089.34375 | 9.63 |
| 45089.354166666664 | 8.89 |
| 45089.364583333336 | 6.77 |
| 45089.375 | 8.51 |
| 45089.385416666664 | 7.53 |
| 45089.395833333336 | 8.22 |
| 45089.40625 | 6.92 |
| 45089.416666666664 | 5.65 |
| 45089.427083333336 | 5.55 |
| 45089.4375 | 5.74 |
| 45089.447916666664 | 5.49 |
| 45089.458333333336 | 5.87 |
| 45089.46875 | 5.15 |
| 45089.479166666664 | 4.96 |
| 45089.489583333336 | 5.26 |
| 45089.5 | 4.91 |
| 45089.510416666664 | 5.03 |
| 45089.520833333336 | 4.79 |
| 45089.53125 | 5.12 |
| 45089.541666666664 | 5.17 |
| 45089.552083333336 | 5.05 |
| 45089.5625 | 4.92 |
| 45089.572916666664 | 4.81 |
| 45089.583333333336 | 4.59 |
| 45089.59375 | 4.72 |
| 45089.604166666664 | 4.98 |
| 45089.614583333336 | 5.18 |
| 45089.625 | 4.34 |
| 45089.635416666664 | 5.06 |
| 45089.645833333336 | 4.72 |
| 45089.65625 | 4.28 |
| 45089.666666666664 | 5.84 |
| 45089.677083333336 | 5.9 |
| 45089.6875 | 5.48 |
| 45089.697916666664 | 5.63 |
| 45089.708333333336 | 6.18 |
| 45089.71875 | 6.63 |
| 45089.729166666664 | 7.39 |
| 45089.739583333336 | 7.82 |
| 45089.75 | 7.11 |
| 45089.760416666664 | 7.18 |
| 45089.770833333336 | 7.06 |
| 45089.78125 | 7.36 |
| 45089.791666666664 | 7.46 |
| 45089.802083333336 | 7.39 |
| 45089.8125 | 7.89 |
| 45089.822916666664 | 6.81 |
| 45089.833333333336 | 8.64 |
| 45089.84375 | 75.81 |
| 45089.854166666664 | 7.31 |
| 45089.864583333336 | 11.11 |
| 45089.875 | 7.65 |
| 45089.885416666664 | 8.07 |
| 45089.895833333336 | 7.25 |
| 45089.90625 | 8.5 |
| 45089.916666666664 | 7.64 |
| 45089.927083333336 | 10.02 |
| 45089.9375 | 9.37 |
| 45089.947916666664 | 9.65 |
| 45089.958333333336 | 10.3 |
| 45089.96875 | 10.48 |
| 45089.979166666664 | 11.11 |
| 45089.989583333336 | 11.4 |
| 45090.0 | 12.55 |
| 45090.010416666664 | 11.91 |
| 45090.020833333336 | 13.51 |
| 45090.03125 | 13.8 |
| 45090.041666666664 | 12.08 |
| 45090.052083333336 | 11.83 |
| 45090.0625 | 11.61 |
| 45090.072916666664 | 11.61 |
| 45090.083333333336 | 10.47 |
| 45090.09375 | 10.35 |
| 45090.104166666664 | 9 |
| 45090.114583333336 | 7.52 |
| 45090.125 | 7.45 |
| 45090.135416666664 | 6.51 |
| 45090.145833333336 | 6.99 |
| 45090.15625 | 7.6 |
| 45090.166666666664 | 7.49 |
| 45090.177083333336 | 8.05 |
| 45090.1875 | 7.42 |
| 45090.197916666664 | 7.34 |
| 45090.208333333336 | 7.69 |
| 45090.21875 | 7.6 |
| 45090.229166666664 | 9.62 |
| 45090.239583333336 | 7.31 |
| 45090.25 | 9.43 |
| 45090.260416666664 | 7.44 |
| 45090.270833333336 | 35.18 |
| 45090.28125 | 9.89 |
| 45090.291666666664 | 7.49 |
| 45090.302083333336 | 20.37 |
| 45090.3125 | 9.67 |
| 45090.322916666664 | 8.42 |
| 45090.333333333336 | 9.59 |
| 45090.34375 | 11.46 |
| 45090.354166666664 | 7.6 |
| 45090.364583333336 | 10.26 |
| 45090.375 | 12.86 |
| 45090.385416666664 | 7.17 |
| 45090.395833333336 | 6.07 |
| 45090.40625 | 5.44 |
| 45090.416666666664 | 5.06 |
| 45090.427083333336 | 4.29 |
| 45090.4375 | 4.43 |
| 45090.447916666664 | 4.11 |
| 45090.458333333336 | 3.93 |
| 45090.46875 | 4.07 |
| 45090.479166666664 | 3.79 |
| 45090.489583333336 | 3.7 |
| 45090.5 | 3.65 |
| 45090.510416666664 | 3.89 |
| 45090.520833333336 | 3.67 |
| 45090.53125 | 3.5 |
| 45090.541666666664 | 3.42 |
| 45090.552083333336 | 3.51 |
| 45090.5625 | 3.43 |
| 45090.572916666664 | 3.51 |
| 45090.583333333336 | 3.8 |
| 45090.59375 | 4.01 |
| 45090.604166666664 | 4.17 |
| 45090.614583333336 | 4.11 |
| 45090.625 | 4.17 |
| 45090.635416666664 | 4.07 |
| 45090.645833333336 | 4.37 |
| 45090.65625 | 5.59 |
| 45090.666666666664 | 5.04 |
| 45090.677083333336 | 13.85 |
| 45090.6875 | 7.29 |
| 45090.697916666664 | 4.93 |
| 45090.708333333336 | 5.76 |
| 45090.71875 | 12.19 |
| 45090.729166666664 | 6.81 |
| 45090.739583333336 | 13.28 |
| 45090.75 | 7 |
| 45090.760416666664 | 22.82 |
| 45090.770833333336 | 5.79 |
| 45090.78125 | 9.94 |
| 45090.791666666664 | 6.17 |
| 45090.802083333336 | 60.28 |
| 45090.8125 | 9.06 |
| 45090.822916666664 | 24.08 |
| 45090.833333333336 | 13.59 |
| 45090.84375 | 11.32 |
| 45090.854166666664 | 14.5 |
| 45090.864583333336 | 8.68 |
| 45090.875 | 9.05 |
| 45090.885416666664 | 9.05 |
| 45090.895833333336 | 10.48 |
| 45090.90625 | 20.99 |
| 45090.916666666664 | 7.69 |
| 45090.927083333336 | 6.85 |
| 45090.9375 | 6.95 |
| 45090.947916666664 | 7.74 |
| 45090.958333333336 | 10.19 |
| 45090.96875 | 8.68 |
| 45090.979166666664 | 8.85 |
| 45090.989583333336 | 8.45 |
| 45091.0 | 8.76 |
| 45091.010416666664 | 9.36 |
| 45091.020833333336 | 9.82 |
| 45091.03125 | 10.16 |
| 45091.041666666664 | 9.53 |
| 45091.052083333336 | 9.44 |
| 45091.0625 | 8.97 |
| 45091.072916666664 | 8.89 |
| 45091.083333333336 | 9.01 |
| 45091.09375 | 8.86 |
| 45091.104166666664 | 8.19 |
| 45091.114583333336 | 7.85 |
| 45091.125 | 7.45 |
| 45091.135416666664 | 7.01 |
| 45091.145833333336 | 6.23 |
| 45091.15625 | 6.1 |
| 45091.166666666664 | 5.84 |
| 45091.177083333336 | 6.05 |
| 45091.1875 | 17.91 |
| 45091.197916666664 | 15.26 |
| 45091.208333333336 | 23.88 |
| 45091.21875 | 25.74 |
| 45091.229166666664 | 14.96 |
| 45091.239583333336 | 13.86 |
| 45091.25 | 19.13 |
| 45091.260416666664 | 14.76 |
| 45091.270833333336 | 21.77 |
| 45091.28125 | 27.54 |
| 45091.291666666664 | 16.68 |
| 45091.302083333336 | 26.95 |
| 45091.3125 | 11.29 |
| 45091.322916666664 | 27.17 |
| 45091.333333333336 | 15.2 |
| 45091.34375 | 39.18 |
| 45091.354166666664 | 18.65 |
| 45091.364583333336 | 16.8 |
| 45091.375 | 17.19 |
| 45091.385416666664 | 39.02 |
| 45091.395833333336 | 19.94 |
| 45091.40625 | 14.22 |
| 45091.416666666664 | 16.87 |
| 45091.427083333336 | 15.59 |
| 45091.4375 | 15.3 |
| 45091.447916666664 | 8.46 |
| 45091.458333333336 | 9.96 |
| 45091.46875 | 9.48 |
| 45091.479166666664 | 16.03 |
| 45091.489583333336 | 3.82 |
| 45091.5 | 3.98 |
| 45091.510416666664 | 3.98 |
| 45091.520833333336 | 3.73 |
| 45091.53125 | 3.64 |
| 45091.541666666664 | 3.75 |
| 45091.552083333336 | 3.77 |
| 45091.5625 | 3.39 |
| 45091.572916666664 | 3.3 |
| 45091.583333333336 | 3.42 |
| 45091.59375 | 4.12 |
| 45091.604166666664 | 9.43 |
| 45091.614583333336 | 4.15 |
| 45091.625 | 3.8 |
| 45091.635416666664 | 4.12 |
| 45091.645833333336 | 4.15 |
| 45091.65625 | 3.96 |
| 45091.666666666664 | 4.09 |
| 45091.677083333336 | 4.79 |
| 45091.6875 | 6.16 |
| 45091.697916666664 | 25.4 |
| 45091.708333333336 | 4.81 |
| 45091.71875 | 10.2 |
| 45091.729166666664 | 21.58 |
| 45091.739583333336 | 49.76 |
| 45091.75 | 9.57 |
| 45091.760416666664 | 27.84 |
| 45091.770833333336 | 8.49 |
| 45091.78125 | 5.65 |
| 45091.791666666664 | 24.76 |
| 45091.802083333336 | 9.93 |
| 45091.8125 | 5.47 |
| 45091.822916666664 | 9.31 |
| 45091.833333333336 | 43.98 |
| 45091.84375 | 72.72 |
| 45091.854166666664 | 7.85 |
| 45091.864583333336 | 15.57 |
| 45091.875 | 32.96 |
| 45091.885416666664 | 28.28 |
| 45091.895833333336 | 57.27 |
| 45091.90625 | 187.89 |
| 45091.916666666664 | 199.81 |
| 45091.927083333336 | 13.29 |
| 45091.9375 | 91.04 |
| 45091.947916666664 | 22.24 |
| 45091.958333333336 | 15.07 |
| 45091.96875 | 26.95 |
| 45091.979166666664 | 35.97 |
| 45091.989583333336 | 6.82 |
| 45092.0 | 6.88 |
| 45092.010416666664 | 6.77 |
| 45092.020833333336 | 7.07 |
| 45092.03125 | 8.54 |
| 45092.041666666664 | 8.83 |
| 45092.052083333336 | 9.08 |
| 45092.0625 | 8.4 |
| 45092.072916666664 | 8.61 |
| 45092.083333333336 | 7.8 |
| 45092.09375 | 7.3 |
| 45092.104166666664 | 6.64 |
| 45092.114583333336 | 6.3 |
| 45092.125 | 7.73 |
| 45092.135416666664 | 6.59 |
| 45092.145833333336 | 6.76 |
| 45092.15625 | 6.34 |
| 45092.166666666664 | 5.95 |
| 45092.177083333336 | 5.72 |
| 45092.1875 | 5.62 |
| 45092.197916666664 | 5.2 |
| 45092.208333333336 | 4.95 |
| 45092.21875 | 5.57 |
| 45092.229166666664 | 5.75 |
| 45092.239583333336 | 70.8 |
| 45092.25 | 21.91 |
| 45092.260416666664 | 23.35 |
| 45092.270833333336 | 11.43 |
| 45092.28125 | 13.05 |
| 45092.291666666664 | 14.26 |
| 45092.302083333336 | 18.29 |
| 45092.3125 | 27.37 |
| 45092.322916666664 | 13.68 |
| 45092.333333333336 | 7.56 |
| 45092.34375 | 22.04 |
| 45092.354166666664 | 11.49 |
| 45092.364583333336 | 12.57 |
| 45092.375 | 14.35 |
| 45092.385416666664 | 16.25 |
| 45092.395833333336 | 28.73 |
| 45092.40625 | 14.12 |
| 45092.416666666664 | 20.86 |
| 45092.427083333336 | 18.15 |
| 45092.4375 | 22.5 |
| 45092.447916666664 | 18.66 |
| 45092.458333333336 | 12.92 |
| 45092.46875 | 17.44 |
| 45092.479166666664 | 23.37 |
| 45092.489583333336 | 28.64 |
| 45092.5 | 3.68 |
| 45092.510416666664 | 3.44 |
| 45092.520833333336 | 3.5 |
| 45092.53125 | 3.38 |
| 45092.541666666664 | 3.33 |
| 45092.552083333336 | 3.18 |
| 45092.5625 | 3.2 |
| 45092.572916666664 | 2.99 |
| 45092.583333333336 | 3.07 |
| 45092.59375 | 3.06 |
| 45092.604166666664 | 3.1 |
| 45092.614583333336 | 3.14 |
| 45092.625 | 3.19 |
| 45092.635416666664 | 3.18 |
| 45092.645833333336 | 3.05 |
| 45092.65625 | 3.43 |
| 45092.666666666664 | 3.17 |
| 45092.677083333336 | 3.74 |
| 45092.6875 | 3.6 |
| 45092.697916666664 | 3.76 |
| 45092.708333333336 | 4.06 |
| 45092.71875 | 4.16 |
| 45092.729166666664 | 9.38 |
| 45092.739583333336 | 21.25 |
| 45092.75 | 17.87 |
| 45092.760416666664 | 105.3 |
| 45092.770833333336 | 29.79 |
| 45092.78125 | 13.81 |
| 45092.791666666664 | 146.86 |
| 45092.802083333336 | 13.24 |
| 45092.8125 | 66.46 |
| 45092.822916666664 | 89.73 |
| 45092.833333333336 | 82.57 |
| 45092.84375 | 141.92 |
| 45092.854166666664 | 45.18 |
| 45092.864583333336 | 70.51 |
| 45092.875 | 43.13 |
| 45092.885416666664 | 100.65 |
| 45092.895833333336 | 143.91 |
| 45092.90625 | 165.87 |
| 45092.916666666664 | 46.54 |
| 45092.927083333336 | 111.84 |
| 45092.9375 | 18.46 |
| 45092.947916666664 | 79.82 |
| 45092.958333333336 | 27.56 |
| 45092.96875 | 57.09 |
| 45092.979166666664 | 51.36 |
| 45092.989583333336 | 56.54 |
| 45093.0 | 96.53 |
| 45093.010416666664 | 120.94 |
| 45093.020833333336 | 19.42 |
| 45093.03125 | 23.59 |
| 45093.041666666664 | 9.56 |
| 45093.052083333336 | 11.38 |
| 45093.0625 | 10.52 |
| 45093.072916666664 | 9.7 |
| 45093.083333333336 | 9.04 |
| 45093.09375 | 10.72 |
| 45093.104166666664 | 9.89 |
| 45093.114583333336 | 8.44 |
| 45093.125 | 7.98 |
| 45093.135416666664 | 7.73 |
| 45093.145833333336 | 7.35 |
| 45093.15625 | 7.85 |
| 45093.166666666664 | 7.24 |
| 45093.177083333336 | 7.18 |
| 45093.1875 | 6.69 |
| 45093.197916666664 | 6.25 |
| 45093.208333333336 | 6.06 |
| 45093.21875 | 5.86 |
| 45093.229166666664 | 5.23 |
| 45093.239583333336 | 4.92 |
| 45093.25 | 4.91 |
| 45093.260416666664 | 5.57 |
| 45093.270833333336 | 5.75 |
| 45093.28125 | 208.66 |
| 45093.291666666664 | 5.11 |
| 45093.302083333336 | 24.88 |
| 45093.3125 | 29.05 |
| 45093.322916666664 | 22.2 |
| 45093.333333333336 | 31.26 |
| 45093.34375 | 19.91 |
| 45093.354166666664 | 17.96 |
| 45093.364583333336 | 40.94 |
| 45093.375 | 19.03 |
| 45093.385416666664 | 29.82 |
| 45093.395833333336 | 75.03 |
| 45093.40625 | 208.05 |
| 45093.416666666664 | 68.31 |
| 45093.427083333336 | 30.2 |
| 45093.4375 | 342.91 |
| 45093.447916666664 | 103.99 |
| 45093.458333333336 | 86.12 |
| 45093.46875 | 104.28 |
| 45093.479166666664 | 235.34 |
| 45093.489583333336 | 83.82 |
| 45093.5 | 32.92 |
| 45093.510416666664 | 45.53 |
| 45093.520833333336 | 78.64 |
| 45093.53125 | 4.03 |
| 45093.541666666664 | 4.35 |
| 45093.552083333336 | 14.27 |
| 45093.5625 | 5.36 |
| 45093.572916666664 | 5 |
| 45093.583333333336 | 4.53 |
| 45093.59375 | 4.37 |
| 45093.604166666664 | 3.89 |
| 45093.614583333336 | 3.83 |
| 45093.625 | 4.32 |
| 45093.635416666664 | 3.96 |
| 45093.645833333336 | 4.23 |
| 45093.65625 | 4.48 |
| 45093.666666666664 | 4.9 |
| 45093.677083333336 | 20.68 |
| 45093.6875 | 5.06 |
| 45093.697916666664 | 7.92 |
| 45093.708333333336 | 5.18 |
| 45093.71875 | 43.78 |
| 45093.729166666664 | 42.35 |
| 45093.739583333336 | 0.43 |
| 45093.75 | 5.34 |
| 45093.760416666664 | 5.69 |
| 45093.770833333336 | 5.91 |
| 45093.78125 | 4.86 |
| 45093.791666666664 | 4.55 |
| 45093.802083333336 | 4.52 |
| 45093.8125 | 4.82 |
| 45093.822916666664 | 5.49 |
| 45093.833333333336 | 5.83 |
| 45093.84375 | 5.87 |
| 45093.854166666664 | 6.35 |
| 45093.864583333336 | 6.58 |
| 45093.875 | 7.08 |
| 45093.885416666664 | 7.44 |
| 45093.895833333336 | 7.61 |
| 45093.90625 | 8.1 |
| 45093.916666666664 | 8.38 |
| 45093.927083333336 | 8.43 |
| 45093.9375 | 8.22 |
| 45093.947916666664 | 8.32 |
| 45093.958333333336 | 7.86 |
| 45093.96875 | 7.88 |
| 45093.979166666664 | 7.7 |
| 45093.989583333336 | 7.28 |
| 45094.0 | 6.73 |
| 45094.010416666664 | 7.38 |
| 45094.020833333336 | 7.37 |
| 45094.03125 | 7.19 |
| 45094.041666666664 | 8.57 |
| 45094.052083333336 | 7.46 |
| 45094.0625 | 7.42 |
| 45094.072916666664 | 6.82 |
| 45094.083333333336 | 5.62 |
| 45094.09375 | 5.94 |
| 45094.104166666664 | 7.07 |
| 45094.114583333336 | 7.05 |
| 45094.125 | 6.63 |
| 45094.135416666664 | 6.53 |
| 45094.145833333336 | 5.43 |
| 45094.15625 | 6.06 |
| 45094.166666666664 | 5.1 |
| 45094.177083333336 | 4.53 |
| 45094.1875 | 4.92 |
| 45094.197916666664 | 3.72 |
| 45094.208333333336 | 3.65 |
| 45094.21875 | 3.99 |
| 45094.229166666664 | 3.68 |
| 45094.239583333336 | 3.59 |
| 45094.25 | 3.43 |
| 45094.260416666664 | 3.46 |
| 45094.270833333336 | 3.28 |
| 45094.28125 | 3.04 |
| 45094.291666666664 | 3 |
| 45094.302083333336 | 3.14 |
| 45094.3125 | 3.88 |
| 45094.322916666664 | 3.29 |
| 45094.333333333336 | 3.23 |
| 45094.34375 | 2.94 |
| 45094.354166666664 | 2.37 |
| 45094.364583333336 | 2.64 |
| 45094.375 | 2.76 |
| 45094.385416666664 | 2.9 |
| 45094.395833333336 | 3.02 |
| 45094.40625 | 2.93 |
| 45094.416666666664 | 2.88 |
| 45094.427083333336 | 2.86 |
| 45094.4375 | 2.74 |
| 45094.447916666664 | 2.61 |
| 45094.458333333336 | 2.62 |
| 45094.46875 | 2.82 |
| 45094.479166666664 | 2.72 |
| 45094.489583333336 | 2.84 |
| 45094.5 | 2.79 |
| 45094.510416666664 | 2.9 |
| 45094.520833333336 | 2.42 |
| 45094.53125 | 2.66 |
| 45094.541666666664 | 2.5 |
| 45094.552083333336 | 2.8 |
| 45094.5625 | 2.79 |
| 45094.572916666664 | 2.86 |
| 45094.583333333336 | 2.82 |
| 45094.59375 | 2.88 |
| 45094.604166666664 | 2.89 |
| 45094.614583333336 | 2.7 |
| 45094.625 | 2.55 |
| 45094.635416666664 | 2.72 |
| 45094.645833333336 | 2.67 |
| 45094.65625 | 2.17 |
| 45094.666666666664 | 2.59 |
| 45094.677083333336 | 2.81 |
| 45094.6875 | 2.99 |
| 45094.697916666664 | 2.52 |
| 45094.708333333336 | 3 |
| 45094.71875 | 3.15 |
| 45094.729166666664 | 3.51 |
| 45094.739583333336 | 3.61 |
| 45094.75 | 3.84 |
| 45094.760416666664 | 3.57 |
| 45094.770833333336 | 4.4 |
| 45094.78125 | 4.08 |
| 45094.791666666664 | 5.2 |
| 45094.802083333336 | 4.32 |
| 45094.8125 | 4.03 |
| 45094.822916666664 | 3.96 |
| 45094.833333333336 | 4.1 |
| 45094.84375 | 4 |
| 45094.854166666664 | 4.46 |
| 45094.864583333336 | 4.51 |
| 45094.875 | 4.73 |
| 45094.885416666664 | 4.56 |
| 45094.895833333336 | 4.72 |
| 45094.90625 | 5.07 |
| 45094.916666666664 | 5.64 |
| 45094.927083333336 | 5.93 |
| 45094.9375 | 6.22 |
| 45094.947916666664 | 6.13 |
| 45094.958333333336 | 6.51 |
| 45094.96875 | 6.95 |
| 45094.979166666664 | 7.18 |
| 45094.989583333336 | 7.01 |
| 45095.0 | 7.05 |
| 45095.010416666664 | 7.29 |
| 45095.020833333336 | 9 |
| 45095.03125 | 8.37 |
| 45095.041666666664 | 7.16 |
| 45095.052083333336 | 7.22 |
| 45095.0625 | 7.38 |
| 45095.072916666664 | 7.31 |
| 45095.083333333336 | 6.9 |
| 45095.09375 | 6.9 |
| 45095.104166666664 | 6.68 |
| 45095.114583333336 | 5.99 |
| 45095.125 | 6.43 |
| 45095.135416666664 | 5.6 |
| 45095.145833333336 | 5.54 |
| 45095.15625 | 6.22 |
| 45095.166666666664 | 5.08 |
| 45095.177083333336 | 4.94 |
| 45095.1875 | 4.34 |
| 45095.197916666664 | 4.01 |
| 45095.208333333336 | 4.29 |
| 45095.21875 | 3.74 |
| 45095.229166666664 | 4.14 |
| 45095.239583333336 | 3.66 |
| 45095.25 | 3.93 |
| 45095.260416666664 | 3.96 |
| 45095.270833333336 | 4.02 |
| 45095.28125 | 3.81 |
| 45095.291666666664 | 3.91 |
| 45095.302083333336 | 3.61 |
| 45095.3125 | 3.73 |
| 45095.322916666664 | 4.71 |
| 45095.333333333336 | 4.39 |
| 45095.34375 | 4.11 |
| 45095.354166666664 | 3.65 |
| 45095.364583333336 | 3.44 |
| 45095.375 | 3.36 |
| 45095.385416666664 | 3.25 |
| 45095.395833333336 | 3.89 |
| 45095.40625 | 3.08 |
| 45095.416666666664 | 2.86 |
| 45095.427083333336 | 2.73 |
| 45095.4375 | 2.6 |
| 45095.447916666664 | 2.71 |
| 45095.458333333336 | 2.65 |
| 45095.46875 | 2.68 |
| 45095.479166666664 | 2.57 |
| 45095.489583333336 | 2.81 |
| 45095.5 | 2.82 |
| 45095.510416666664 | 2.87 |
| 45095.520833333336 | 2.85 |
| 45095.53125 | 3.1 |
| 45095.541666666664 | 2.83 |
| 45095.552083333336 | 2.79 |
| 45095.5625 | 2.9 |
| 45095.572916666664 | 2.57 |
| 45095.583333333336 | 2.67 |
| 45095.59375 | 2.73 |
| 45095.604166666664 | 2.54 |
| 45095.614583333336 | 2.72 |
| 45095.625 | 3.01 |
| 45095.635416666664 | 2.82 |
| 45095.645833333336 | 2.7 |
| 45095.65625 | 2.7 |
| 45095.666666666664 | 2.62 |
| 45095.677083333336 | 2.34 |
| 45095.6875 | 2.49 |
| 45095.697916666664 | 2.86 |
| 45095.708333333336 | 2.9 |
| 45095.71875 | 3.5 |
| 45095.729166666664 | 3.74 |
| 45095.739583333336 | 3.89 |
| 45095.75 | 4.4 |
| 45095.760416666664 | 4.49 |
| 45095.770833333336 | 4.64 |
| 45095.78125 | 5.03 |
| 45095.791666666664 | 5.54 |
| 45095.802083333336 | 6.1 |
| 45095.8125 | 6.51 |
| 45095.822916666664 | 7.92 |
| 45095.833333333336 | 6.41 |
| 45095.84375 | 6.31 |
| 45095.854166666664 | 6.47 |
| 45095.864583333336 | 5.61 |
| 45095.875 | 6.17 |
| 45095.885416666664 | 6.52 |
| 45095.895833333336 | 6.54 |
| 45095.90625 | 6.82 |
| 45095.916666666664 | 7.44 |
| 45095.927083333336 | 7.28 |
| 45095.9375 | 7.49 |
| 45095.947916666664 | 7.83 |
| 45095.958333333336 | 7.83 |
| 45095.96875 | 7.84 |
| 45095.979166666664 | 7.73 |
| 45095.989583333336 | 7.84 |
| 45096.0 | 7.85 |
| 45096.010416666664 | 8.39 |
| 45096.020833333336 | 9.1 |
| 45096.03125 | 9.64 |
| 45096.041666666664 | 10.1 |
| 45096.052083333336 | 10.12 |
| 45096.0625 | 9.82 |
| 45096.072916666664 | 9.43 |
| 45096.083333333336 | 10.02 |
| 45096.09375 | 8.7 |
| 45096.104166666664 | 8.15 |
| 45096.114583333336 | 7.1 |
| 45096.125 | 7.73 |
| 45096.135416666664 | 7.39 |
| 45096.145833333336 | 7.09 |
| 45096.15625 | 7.95 |
| 45096.166666666664 | 7.16 |
| 45096.177083333336 | 7.16 |
| 45096.1875 | 6.03 |
| 45096.197916666664 | 6.68 |
| 45096.208333333336 | 5.38 |
| 45096.21875 | 6.23 |
| 45096.229166666664 | 5.56 |
| 45096.239583333336 | 6.12 |
| 45096.25 | 5.13 |
| 45096.260416666664 | 4.82 |
| 45096.270833333336 | 4.74 |
| 45096.28125 | 5.24 |
| 45096.291666666664 | 4.69 |
| 45096.302083333336 | 4.75 |
| 45096.3125 | 4.92 |
| 45096.322916666664 | 4.51 |
| 45096.333333333336 | 4.48 |
| 45096.34375 | 5.04 |
| 45096.354166666664 | 5.19 |
| 45096.364583333336 | 5.06 |
| 45096.375 | 3.91 |
| 45096.385416666664 | 3.93 |
| 45096.395833333336 | 4.06 |
| 45096.40625 | 3.83 |
| 45096.416666666664 | 4 |
| 45096.427083333336 | 3.82 |
| 45096.4375 | 3.92 |
| 45096.447916666664 | 3.74 |
| 45096.458333333336 | 3.8 |
| 45096.46875 | 3.86 |
| 45096.479166666664 | 3.86 |
| 45096.489583333336 | 3.98 |
| 45096.5 | 3.58 |
| 45096.510416666664 | 3.87 |
| 45096.520833333336 | 3.89 |
| 45096.53125 | 4.02 |
| 45096.541666666664 | 4.05 |
| 45096.552083333336 | 4.37 |
| 45096.5625 | 4.32 |
| 45096.572916666664 | 4.39 |
| 45096.583333333336 | 4.5 |
| 45096.59375 | 4.51 |
| 45096.604166666664 | 4.62 |
| 45096.614583333336 | 4.78 |
| 45096.625 | 3.89 |
| 45096.635416666664 | 4.09 |
| 45096.645833333336 | 3.88 |
| 45096.65625 | 4.19 |
| 45096.666666666664 | 4.34 |
| 45096.677083333336 | 3.86 |
| 45096.6875 | 3.92 |
| 45096.697916666664 | 4.09 |
| 45096.708333333336 | 4.01 |
| 45096.71875 | 4.05 |
| 45096.729166666664 | 4.03 |
| 45096.739583333336 | 4.55 |
| 45096.75 | 4.95 |
| 45096.760416666664 | 5.46 |
| 45096.770833333336 | 6.1 |
| 45096.78125 | 6.15 |
| 45096.791666666664 | 6.88 |
| 45096.802083333336 | 7.5 |
| 45096.8125 | 7.69 |
| 45096.822916666664 | 8.51 |
| 45096.833333333336 | 8.8 |
| 45096.84375 | 9.85 |
| 45096.854166666664 | 8.38 |
| 45096.864583333336 | 8.27 |
| 45096.875 | 8.22 |
| 45096.885416666664 | 7.7 |
| 45096.895833333336 | 7.92 |
| 45096.90625 | 10.55 |
| 45096.916666666664 | 11.2 |
| 45096.927083333336 | 11.03 |
| 45096.9375 | 11.94 |
| 45096.947916666664 | 12.26 |
| 45096.958333333336 | 13.35 |
| 45096.96875 | 14.04 |
| 45096.979166666664 | 15.06 |
| 45096.989583333336 | 15.73 |
| 45097.0 | 15.31 |
| 45097.010416666664 | 16.04 |
| 45097.020833333336 | 16.54 |
| 45097.03125 | 16.99 |
| 45097.041666666664 | 17.05 |
| 45097.052083333336 | 16.16 |
| 45097.0625 | 15.83 |
| 45097.072916666664 | 15.56 |
| 45097.083333333336 | 16.08 |
| 45097.09375 | 15.02 |
| 45097.104166666664 | 15.65 |
| 45097.114583333336 | 15.1 |
| 45097.125 | 15.12 |
| 45097.135416666664 | 13.69 |
| 45097.145833333336 | 14.13 |
| 45097.15625 | 14.71 |
| 45097.166666666664 | 14.02 |
| 45097.177083333336 | 14.77 |
| 45097.1875 | 13.1 |
| 45097.197916666664 | 13.92 |
| 45097.208333333336 | 13.3 |
| 45097.21875 | 12.32 |
| 45097.229166666664 | 11.31 |
| 45097.239583333336 | 12.01 |
| 45097.25 | 10.47 |
| 45097.260416666664 | 8.94 |
| 45097.270833333336 | 8.18 |
| 45097.28125 | 8.33 |
| 45097.291666666664 | 8.64 |
| 45097.302083333336 | 7.56 |
| 45097.3125 | 7.3 |
| 45097.322916666664 | 7.34 |
| 45097.333333333336 | 6.75 |
| 45097.34375 | 6.61 |
| 45097.354166666664 | 5.92 |
| 45097.364583333336 | 5.4 |
| 45097.375 | 5.96 |
| 45097.385416666664 | 5.39 |
| 45097.395833333336 | 5.73 |
| 45097.40625 | 5.47 |
| 45097.416666666664 | 4.68 |
| 45097.427083333336 | 4.33 |
| 45097.4375 | 4.5 |
| 45097.447916666664 | 4.77 |
| 45097.458333333336 | 4.9 |
| 45097.46875 | 4.94 |
| 45097.479166666664 | 4.89 |
| 45097.489583333336 | 5.12 |
| 45097.5 | 5.42 |
| 45097.510416666664 | 5.37 |
| 45097.520833333336 | 5.08 |
| 45097.53125 | 5.28 |
| 45097.541666666664 | 5.1 |
| 45097.552083333336 | 5.04 |
| 45097.5625 | 5.07 |
| 45097.572916666664 | 4.77 |
| 45097.583333333336 | 5.16 |
| 45097.59375 | 5.17 |
| 45097.604166666664 | 5.61 |
| 45097.614583333336 | 5.39 |
| 45097.625 | 5.16 |
| 45097.635416666664 | 5.26 |
| 45097.645833333336 | 5.72 |
| 45097.65625 | 5.65 |
| 45097.666666666664 | 6.04 |
| 45097.677083333336 | 5.54 |
| 45097.6875 | 5.38 |
| 45097.697916666664 | 4.98 |
| 45097.708333333336 | 4.82 |
| 45097.71875 | 5.25 |
| 45097.729166666664 | 5.06 |
| 45097.739583333336 | 5.07 |
| 45097.75 | 5.3 |
| 45097.760416666664 | 5.46 |
| 45097.770833333336 | 5.72 |
| 45097.78125 | 6.12 |
| 45097.791666666664 | 6.71 |
| 45097.802083333336 | 6.64 |
| 45097.8125 | 6.98 |
| 45097.822916666664 | 6.67 |
| 45097.833333333336 | 6.79 |
| 45097.84375 | 6.65 |
| 45097.854166666664 | 6.58 |
| 45097.864583333336 | 6.86 |
| 45097.875 | 7.13 |
| 45097.885416666664 | 5.9 |
| 45097.895833333336 | 6.11 |
| 45097.90625 | 6.34 |
| 45097.916666666664 | 6.02 |
| 45097.927083333336 | 6.06 |
| 45097.9375 | 5.98 |
| 45097.947916666664 | 5.75 |
| 45097.958333333336 | 6.3 |
| 45097.96875 | 6.55 |
| 45097.979166666664 | 7.32 |
| 45097.989583333336 | 7.95 |
| 45098.0 | 8.16 |
| 45098.010416666664 | 8.39 |
| 45098.020833333336 | 8.46 |
| 45098.03125 | 8.96 |
| 45098.041666666664 | 8.81 |
| 45098.052083333336 | 8.48 |
| 45098.0625 | 8.64 |
| 45098.072916666664 | 8.92 |
| 45098.083333333336 | 8.58 |
| 45098.09375 | 8.59 |
| 45098.104166666664 | 8.65 |
| 45098.114583333336 | 8.53 |
| 45098.125 | 7.59 |
| 45098.135416666664 | 6.94 |
| 45098.145833333336 | 6.74 |
| 45098.15625 | 6.4 |
| 45098.166666666664 | 6.04 |
| 45098.177083333336 | 5.93 |
| 45098.1875 | 5.75 |
| 45098.197916666664 | 6.32 |
| 45098.208333333336 | 5.98 |
| 45098.21875 | 6.05 |
| 45098.229166666664 | 5.35 |
| 45098.239583333336 | 5.39 |
| 45098.25 | 5.34 |
| 45098.260416666664 | 5.62 |
| 45098.270833333336 | 5.97 |
| 45098.28125 | 6.09 |
| 45098.291666666664 | 5.79 |
| 45098.302083333336 | 6.16 |
| 45098.3125 | 5.94 |
| 45098.322916666664 | 5.92 |
| 45098.333333333336 | 5.48 |
| 45098.34375 | 5.75 |
| 45098.354166666664 | 5.71 |
| 45098.364583333336 | 6.6 |
| 45098.375 | 6.58 |
| 45098.385416666664 | 6.62 |
| 45098.395833333336 | 7.05 |
| 45098.40625 | 7.09 |
| 45098.416666666664 | 6.59 |
| 45098.427083333336 | 6.75 |
| 45098.4375 | 6.91 |
| 45098.447916666664 | 6.61 |
| 45098.458333333336 | 6.81 |
| 45098.46875 | 7.43 |
| 45098.479166666664 | 7.24 |
| 45098.489583333336 | 7.51 |
| 45098.5 | 6.2 |
| 45098.510416666664 | 6.49 |
| 45098.520833333336 | 6.58 |
| 45098.53125 | 7.03 |
| 45098.541666666664 | 6.84 |
| 45098.552083333336 | 7.34 |
| 45098.5625 | 6.57 |
| 45098.572916666664 | 6.05 |
| 45098.583333333336 | 5.98 |
| 45098.59375 | 6.4 |
| 45098.604166666664 | 6.47 |
| 45098.614583333336 | 6.72 |
| 45098.625 | 7.1 |
| 45098.635416666664 | 7.38 |
| 45098.645833333336 | 7.04 |
| 45098.65625 | 7.02 |
| 45098.666666666664 | 7.08 |
| 45098.677083333336 | 6.28 |
| 45098.6875 | 7.29 |
| 45098.697916666664 | 6.98 |
| 45098.708333333336 | 6.88 |
| 45098.71875 | 7.13 |
| 45098.729166666664 | 7.01 |
| 45098.739583333336 | 7.18 |
| 45098.75 | 7.17 |
| 45098.760416666664 | 7.29 |
| 45098.770833333336 | 7.14 |
| 45098.78125 | 7.23 |
| 45098.791666666664 | 7.11 |
| 45098.802083333336 | 7.18 |
| 45098.8125 | 6.93 |
| 45098.822916666664 | 6.9 |
| 45098.833333333336 | 6.77 |
| 45098.84375 | 6.89 |
| 45098.864583333336 | 6.82 |
| 45098.875 | 6.86 |
| 45098.885416666664 | 6.61 |
| 45098.895833333336 | 7.07 |
| 45098.90625 | 6.82 |
| 45098.916666666664 | 7.46 |
| 45098.927083333336 | 7.11 |
| 45098.9375 | 6.97 |
| 45098.947916666664 | 7.13 |
| 45098.958333333336 | 5.9 |
| 45098.96875 | 5.58 |
| 45098.979166666664 | 6.42 |
| 45098.989583333336 | 6.69 |
| 45099.0 | 6.43 |
| 45099.010416666664 | 6.56 |
| 45099.020833333336 | 6.31 |
| 45099.03125 | 6.06 |
| 45099.041666666664 | 5.69 |
| 45099.052083333336 | 5.42 |
| 45099.0625 | 5.29 |
| 45099.072916666664 | 5.21 |
| 45099.083333333336 | 4.64 |
| 45099.09375 | 4.44 |
| 45099.104166666664 | 4.48 |
| 45099.114583333336 | 4.28 |
| 45099.125 | 4.19 |
| 45099.135416666664 | 3.71 |
| 45099.145833333336 | 3.62 |
| 45099.15625 | 3.53 |
| 45099.166666666664 | 3.84 |
| 45099.177083333336 | 3.67 |
| 45099.1875 | 4.02 |
| 45099.197916666664 | 3.92 |
| 45099.208333333336 | 3.77 |
| 45099.21875 | 3.59 |
| 45099.229166666664 | 3.68 |
| 45099.239583333336 | 3.69 |
| 45099.25 | 3.57 |
| 45099.260416666664 | 3.69 |
| 45099.270833333336 | 3.77 |
| 45099.28125 | 3.6 |
| 45099.291666666664 | 3.72 |
| 45099.302083333336 | 3.57 |
| 45099.3125 | 3.37 |
| 45099.322916666664 | 3.59 |
| 45099.333333333336 | 3.5 |
| 45099.34375 | 3.28 |
| 45099.354166666664 | 3.42 |
| 45099.364583333336 | 3.34 |
| 45099.375 | 3.24 |
| 45099.385416666664 | 3.19 |
| 45099.395833333336 | 3.43 |
| 45099.40625 | 3.39 |
| 45099.416666666664 | 2.94 |
| 45099.427083333336 | 2.92 |
| 45099.4375 | 2.87 |
| 45099.447916666664 | 2.64 |
| 45099.458333333336 | 2.77 |
| 45099.46875 | 2.82 |
| 45099.479166666664 | 2.62 |
| 45099.489583333336 | 2.78 |
| 45099.5 | 2.43 |
| 45099.510416666664 | 2.7 |
| 45099.520833333336 | 2.58 |
| 45099.53125 | 2.67 |
| 45099.541666666664 | 2.48 |
| 45099.552083333336 | 2.48 |
| 45099.5625 | 2.45 |
| 45099.572916666664 | 2.39 |
| 45099.583333333336 | 2.49 |
| 45099.59375 | 2.36 |
| 45099.604166666664 | 2.48 |
| 45099.614583333336 | 2.43 |
| 45099.625 | 2.43 |
| 45099.635416666664 | 2.23 |
| 45099.645833333336 | 2.22 |
| 45099.65625 | 2.13 |
| 45099.666666666664 | 2.22 |
| 45099.677083333336 | 2.19 |
| 45099.6875 | 2.47 |
| 45099.697916666664 | 2.43 |
| 45099.708333333336 | 2.48 |
| 45099.71875 | 2.44 |
| 45099.729166666664 | 2.77 |
| 45099.739583333336 | 2.6 |
| 45099.75 | 2.79 |
| 45099.760416666664 | 2.84 |
| 45099.770833333336 | 3.04 |
| 45099.78125 | 2.86 |
| 45099.791666666664 | 2.83 |
| 45099.802083333336 | 3.06 |
| 45099.8125 | 2.86 |
| 45099.822916666664 | 2.77 |
| 45099.833333333336 | 2.82 |
| 45099.84375 | 3.15 |
| 45099.854166666664 | 3.09 |
| 45099.864583333336 | 3.15 |
| 45099.875 | 3.43 |
| 45099.885416666664 | 3.7 |
| 45099.895833333336 | 3.66 |
| 45099.90625 | 3.73 |
| 45099.916666666664 | 3.89 |
| 45099.927083333336 | 3.83 |
| 45099.9375 | 3.62 |
| 45099.947916666664 | 3.78 |
| 45099.958333333336 | 3.84 |
| 45099.96875 | 3.96 |
| 45099.979166666664 | 3.39 |
| 45099.989583333336 | 3.24 |
| 45100.0 | 3.37 |
| 45100.010416666664 | 3.41 |
| 45100.020833333336 | 3.86 |
| 45100.03125 | 3.96 |
| 45100.041666666664 | 3.92 |
| 45100.052083333336 | 3.84 |
| 45100.0625 | 3.48 |
| 45100.072916666664 | 3.4 |
| 45100.083333333336 | 3.43 |
| 45100.09375 | 3.24 |
| 45100.104166666664 | 3.18 |
| 45100.114583333336 | 3.05 |
| 45100.125 | 3.07 |
| 45100.135416666664 | 3.14 |
| 45100.145833333336 | 3.09 |
| 45100.15625 | 3.32 |
| 45100.166666666664 | 3.17 |
| 45100.177083333336 | 3.09 |
| 45100.1875 | 3.3 |
| 45100.197916666664 | 3.65 |
| 45100.208333333336 | 3.27 |
| 45100.21875 | 3.59 |
| 45100.229166666664 | 2.76 |
| 45100.239583333336 | 2.68 |
| 45100.25 | 2.8 |
| 45100.260416666664 | 2.57 |
| 45100.270833333336 | 2.51 |
| 45100.28125 | 2.38 |
| 45100.291666666664 | 2.73 |
| 45100.302083333336 | 2.03 |
| 45100.3125 | 2.16 |
| 45100.322916666664 | 2.04 |
| 45100.333333333336 | 2.15 |
| 45100.34375 | 1.9 |
| 45100.354166666664 | 1.94 |
| 45100.364583333336 | 1.96 |
| 45100.375 | 2.25 |
| 45100.385416666664 | 2.14 |
| 45100.395833333336 | 2.12 |
| 45100.40625 | 1.95 |
| 45100.416666666664 | 1.94 |
| 45100.427083333336 | 1.91 |
| 45100.4375 | 2.22 |
| 45100.447916666664 | 2.29 |
| 45100.458333333336 | 2.15 |
| 45100.46875 | 2.16 |
| 45100.479166666664 | 2.39 |
| 45100.489583333336 | 2.08 |
| 45100.5 | 2.08 |
| 45100.510416666664 | 2.06 |
| 45100.520833333336 | 1.92 |
| 45100.53125 | 2.12 |
| 45100.541666666664 | 1.96 |
| 45100.552083333336 | 2.47 |
| 45100.5625 | 2.45 |
| 45100.572916666664 | 2.51 |
| 45100.583333333336 | 2.45 |
| 45100.59375 | 2.49 |
| 45100.604166666664 | 2.45 |
| 45100.614583333336 | 2.72 |
| 45100.625 | 2.52 |
| 45100.635416666664 | 2.74 |
| 45100.645833333336 | 2.66 |
| 45100.65625 | 2.8 |
| 45100.666666666664 | 2.73 |
| 45100.677083333336 | 2.62 |
| 45100.6875 | 2.87 |
| 45100.697916666664 | 2.78 |
| 45100.708333333336 | 2.98 |
| 45100.71875 | 3.23 |
| 45100.729166666664 | 2.83 |
| 45100.739583333336 | 3.08 |
| 45100.75 | 3.13 |
| 45100.760416666664 | 3.38 |
| 45100.770833333336 | 2.71 |
| 45100.78125 | 3.19 |
| 45100.791666666664 | 2.96 |
| 45100.802083333336 | 2.67 |
| 45100.8125 | 2.79 |
| 45100.822916666664 | 2.74 |
| 45100.833333333336 | 2.78 |
| 45100.84375 | 2.68 |
| 45100.854166666664 | 3.21 |
| 45100.864583333336 | 3.41 |
| 45100.875 | 3.73 |
| 45100.885416666664 | 3.44 |
| 45100.895833333336 | 3.98 |
| 45100.90625 | 4.18 |
| 45100.916666666664 | 4.46 |
| 45100.927083333336 | 4.32 |
| 45100.9375 | 4.24 |
| 45100.947916666664 | 4.27 |
| 45100.958333333336 | 4.21 |
| 45100.96875 | 4.09 |
| 45100.979166666664 | 4.02 |
| 45100.989583333336 | 4.27 |
| 45101.0 | 4.24 |
| 45101.010416666664 | 4.61 |
| 45101.020833333336 | 4.06 |
| 45101.03125 | 4.18 |
| 45101.041666666664 | 4.44 |
| 45101.052083333336 | 4.45 |
| 45101.0625 | 4.53 |
| 45101.072916666664 | 4.56 |
| 45101.083333333336 | 4.51 |
| 45101.09375 | 4.25 |
| 45101.104166666664 | 4.65 |
| 45101.114583333336 | 4.79 |
| 45101.125 | 4.94 |
| 45101.135416666664 | 5.03 |
| 45101.145833333336 | 4.98 |
| 45101.15625 | 4.48 |
| 45101.166666666664 | 4.13 |
| 45101.177083333336 | 4.07 |
| 45101.1875 | 3.98 |
| 45101.197916666664 | 4.06 |
| 45101.208333333336 | 4.03 |
| 45101.21875 | 4.46 |
| 45101.229166666664 | 4.16 |
| 45101.239583333336 | 4 |
| 45101.25 | 3.77 |
| 45101.260416666664 | 3.78 |
| 45101.270833333336 | 3.28 |
| 45101.28125 | 3.24 |
| 45101.291666666664 | 3.07 |
| 45101.302083333336 | 2.38 |
| 45101.3125 | 3.05 |
| 45101.322916666664 | 3.24 |
| 45101.333333333336 | 2.8 |
| 45101.34375 | 3.1 |
| 45101.354166666664 | 2.68 |
| 45101.364583333336 | 2.36 |
| 45101.375 | 2.23 |
| 45101.385416666664 | 2.39 |
| 45101.395833333336 | 2.51 |
| 45101.40625 | 2.54 |
| 45101.416666666664 | 2.36 |
| 45101.427083333336 | 2.46 |
| 45101.4375 | 2.49 |
| 45101.447916666664 | 2.5 |
| 45101.458333333336 | 3.18 |
| 45101.46875 | 2.93 |
| 45101.479166666664 | 3.45 |
| 45101.489583333336 | 3.09 |
| 45101.5 | 2.91 |
| 45101.510416666664 | 2.52 |
| 45101.520833333336 | 2.28 |
| 45101.53125 | 2.08 |
| 45101.541666666664 | 2.22 |
| 45101.552083333336 | 2.23 |
| 45101.5625 | 2.19 |
| 45101.572916666664 | 2.25 |
| 45101.583333333336 | 2.27 |
| 45101.59375 | 2.31 |
| 45101.604166666664 | 2.5 |
| 45101.614583333336 | 2.25 |
| 45101.625 | 2.51 |
| 45101.635416666664 | 2.35 |
| 45101.645833333336 | 2.46 |
| 45101.65625 | 2.56 |
| 45101.666666666664 | 2.57 |
| 45101.677083333336 | 2.51 |
| 45101.6875 | 2.68 |
| 45101.697916666664 | 2.67 |
| 45101.708333333336 | 2.82 |
| 45101.71875 | 2.68 |
| 45101.729166666664 | 3.09 |
| 45101.739583333336 | 3.06 |
| 45101.75 | 2.76 |
| 45101.760416666664 | 3.31 |
| 45101.770833333336 | 3.4 |
| 45101.78125 | 3.56 |
| 45101.791666666664 | 4.23 |
| 45101.802083333336 | 3.59 |
| 45101.8125 | 4.03 |
| 45101.822916666664 | 3.69 |
| 45101.833333333336 | 3.18 |
| 45101.84375 | 3.12 |
| 45101.854166666664 | 3.7 |
| 45101.864583333336 | 3.42 |
| 45101.875 | 3.84 |
| 45101.885416666664 | 3.3 |
| 45101.895833333336 | 3.84 |
| 45101.90625 | 3.97 |
| 45101.916666666664 | 4.32 |
| 45101.927083333336 | 4.82 |
| 45101.9375 | 4.83 |
| 45101.947916666664 | 4.83 |
| 45101.958333333336 | 4.99 |
| 45101.96875 | 5.11 |
| 45101.979166666664 | 5.07 |
| 45101.989583333336 | 5.1 |
| 45102.0 | 4.75 |
| 45102.010416666664 | 5.01 |
| 45102.020833333336 | 5.34 |
| 45102.03125 | 5.56 |
| 45102.041666666664 | 5.14 |
| 45102.052083333336 | 4.74 |
| 45102.0625 | 4.32 |
| 45102.072916666664 | 4.76 |
| 45102.083333333336 | 6.16 |
| 45102.09375 | 5.96 |
| 45102.104166666664 | 6.34 |
| 45102.114583333336 | 6.04 |
| 45102.125 | 6.03 |
| 45102.135416666664 | 5.91 |
| 45102.145833333336 | 5.92 |
| 45102.15625 | 5.37 |
| 45102.166666666664 | 5.26 |
| 45102.177083333336 | 4.92 |
| 45102.1875 | 4.86 |
| 45102.197916666664 | 4.92 |
| 45102.208333333336 | 4.87 |
| 45102.21875 | 5.12 |
| 45102.229166666664 | 5.14 |
| 45102.239583333336 | 4.95 |
| 45102.25 | 4.98 |
| 45102.260416666664 | 5 |
| 45102.270833333336 | 5.25 |
| 45102.28125 | 5.29 |
| 45102.291666666664 | 4.99 |
| 45102.302083333336 | 4.14 |
| 45102.3125 | 4.33 |
| 45102.322916666664 | 4.59 |
| 45102.333333333336 | 3.92 |
| 45102.34375 | 4.07 |
| 45102.354166666664 | 4.25 |
| 45102.364583333336 | 4.06 |
| 45102.375 | 3.76 |
| 45102.385416666664 | 3.12 |
| 45102.395833333336 | 2.83 |
| 45102.40625 | 2.78 |
| 45102.416666666664 | 2.7 |
| 45102.427083333336 | 2.73 |
| 45102.4375 | 2.74 |
| 45102.447916666664 | 2.76 |
| 45102.458333333336 | 2.73 |
| 45102.46875 | 2.91 |
| 45102.479166666664 | 2.93 |
| 45102.489583333336 | 2.89 |
| 45102.5 | 3.04 |
| 45102.510416666664 | 3.36 |
| 45102.520833333336 | 3.51 |
| 45102.53125 | 3.75 |
| 45102.541666666664 | 3.74 |
| 45102.552083333336 | 3.74 |
| 45102.5625 | 2.19 |
| 45102.572916666664 | 2.26 |
| 45102.583333333336 | 2.28 |
| 45102.59375 | 2.4 |
| 45102.604166666664 | 2.57 |
| 45102.614583333336 | 2.55 |
| 45102.625 | 2.73 |
| 45102.635416666664 | 2.63 |
| 45102.645833333336 | 3.08 |
| 45102.65625 | 2.82 |
| 45102.666666666664 | 2.87 |
| 45102.677083333336 | 3.09 |
| 45102.6875 | 3.24 |
| 45102.697916666664 | 3.23 |
| 45102.708333333336 | 3.38 |
| 45102.71875 | 3.3 |
| 45102.729166666664 | 3.38 |
| 45102.739583333336 | 3.45 |
| 45102.75 | 3.74 |
| 45102.760416666664 | 5.51 |
| 45102.770833333336 | 5.95 |
| 45102.78125 | 5.65 |
| 45102.791666666664 | 5.65 |
| 45102.802083333336 | 7.92 |
| 45102.8125 | 8.9 |
| 45102.822916666664 | 7.52 |
| 45102.833333333336 | 9.3 |
| 45102.84375 | 8.43 |
| 45102.854166666664 | 6.47 |
| 45102.864583333336 | 6.03 |
| 45102.875 | 5.73 |
| 45102.885416666664 | 5.4 |
| 45102.895833333336 | 5.72 |
| 45102.90625 | 6.45 |
| 45102.916666666664 | 5.83 |
| 45102.927083333336 | 5.82 |
| 45102.9375 | 5.9 |
| 45102.947916666664 | 5.97 |
| 45102.958333333336 | 6.07 |
| 45102.96875 | 6.29 |
| 45102.979166666664 | 6.31 |
| 45102.989583333336 | 6.53 |
| 45103.0 | 6.86 |
| 45103.010416666664 | 6.78 |
| 45103.020833333336 | 7.84 |
| 45103.03125 | 8.51 |
| 45103.041666666664 | 7.93 |
| 45103.052083333336 | 7.24 |
| 45103.0625 | 6.85 |
| 45103.072916666664 | 6.2 |
| 45103.083333333336 | 6.17 |
| 45103.09375 | 6.65 |
| 45103.104166666664 | 8.1 |
| 45103.114583333336 | 9.45 |
| 45103.125 | 8.64 |
| 45103.135416666664 | 8.47 |
| 45103.145833333336 | 8.55 |
| 45103.15625 | 8.66 |
| 45103.166666666664 | 10.2 |
| 45103.177083333336 | 10.32 |
| 45103.1875 | 9.74 |
| 45103.197916666664 | 9.66 |
| 45103.208333333336 | 9.48 |
| 45103.21875 | 9.3 |
| 45103.229166666664 | 8.92 |
| 45103.239583333336 | 9.65 |
| 45103.25 | 9.58 |
| 45103.260416666664 | 8.89 |
| 45103.270833333336 | 8.44 |
| 45103.28125 | 8.52 |
| 45103.291666666664 | 8.26 |
| 45103.302083333336 | 8.36 |
| 45103.3125 | 7.25 |
| 45103.322916666664 | 22.88 |
| 45103.333333333336 | 6.77 |
| 45103.34375 | 6.64 |
| 45103.354166666664 | 6.35 |
| 45103.364583333336 | 6.32 |
| 45103.375 | 5.55 |
| 45103.385416666664 | 6.01 |
| 45103.395833333336 | 5.35 |
| 45103.40625 | 5.87 |
| 45103.416666666664 | 4.85 |
| 45103.427083333336 | 4.44 |
| 45103.4375 | 3.98 |
| 45103.447916666664 | 4.29 |
| 45103.458333333336 | 4.31 |
| 45103.46875 | 4.22 |
| 45103.479166666664 | 4.2 |
| 45103.489583333336 | 4.34 |
| 45103.5 | 4.49 |
| 45103.510416666664 | 4.72 |
| 45103.520833333336 | 4.83 |
| 45103.53125 | 5.05 |
| 45103.541666666664 | 4.95 |
| 45103.552083333336 | 3.87 |
| 45103.5625 | 3.61 |
| 45103.572916666664 | 3.31 |
| 45103.583333333336 | 3.31 |
| 45103.59375 | 3.4 |
| 45103.604166666664 | 3.66 |
| 45103.614583333336 | 3.68 |
| 45103.625 | 4.06 |
| 45103.635416666664 | 4.09 |
| 45103.645833333336 | 4.58 |
| 45103.65625 | 4.31 |
| 45103.666666666664 | 4.82 |
| 45103.677083333336 | 4.58 |
| 45103.6875 | 4.8 |
| 45103.697916666664 | 5.03 |
| 45103.708333333336 | 5.12 |
| 45103.71875 | 4.76 |
| 45103.729166666664 | 5.15 |
| 45103.739583333336 | 5.23 |
| 45103.75 | 5.55 |
| 45103.760416666664 | 5.06 |
| 45103.770833333336 | 5.29 |
| 45103.78125 | 5.49 |
| 45103.791666666664 | 5.48 |
| 45103.802083333336 | 5.42 |
| 45103.8125 | 5.87 |
| 45103.822916666664 | 5.39 |
| 45103.833333333336 | 5.92 |
| 45103.84375 | 6.77 |
| 45103.854166666664 | 5.46 |
| 45103.864583333336 | 6.91 |
| 45103.875 | 6.94 |
| 45103.885416666664 | 7.43 |
| 45103.895833333336 | 7.59 |
| 45103.90625 | 6.82 |
| 45103.916666666664 | 6.36 |
| 45103.927083333336 | 6.12 |
| 45103.9375 | 6.22 |
| 45103.947916666664 | 6.73 |
| 45103.958333333336 | 7.54 |
| 45103.96875 | 8.04 |
| 45103.979166666664 | 8.68 |
| 45103.989583333336 | 8.5 |
| 45104.0 | 8.56 |
| 45104.010416666664 | 8.79 |
| 45104.020833333336 | 9.54 |
| 45104.03125 | 10.65 |
| 45104.041666666664 | 11.17 |
| 45104.052083333336 | 11.89 |
| 45104.0625 | 11.96 |
| 45104.072916666664 | 12.09 |
| 45104.083333333336 | 11.23 |
| 45104.09375 | 10.24 |
| 45104.104166666664 | 11.16 |
| 45104.114583333336 | 10.39 |
| 45104.125 | 9.69 |
| 45104.135416666664 | 9.38 |
| 45104.145833333336 | 8.63 |
| 45104.15625 | 8.51 |
| 45104.166666666664 | 8.4 |
| 45104.177083333336 | 7.93 |
| 45104.1875 | 7.94 |
| 45104.197916666664 | 6.75 |
| 45104.208333333336 | 7.37 |
| 45104.21875 | 7.44 |
| 45104.229166666664 | 7.29 |
| 45104.239583333336 | 7.53 |
| 45104.25 | 7.34 |
| 45104.260416666664 | 7.14 |
| 45104.270833333336 | 6.47 |
| 45104.28125 | 6.68 |
| 45104.291666666664 | 6.93 |
| 45104.302083333336 | 6.38 |
| 45104.3125 | 6.38 |
| 45104.322916666664 | 6.23 |
| 45104.333333333336 | 6.12 |
| 45104.34375 | 5.65 |
| 45104.354166666664 | 5.17 |
| 45104.364583333336 | 5.11 |
| 45104.375 | 4.75 |
| 45104.385416666664 | 4.94 |
| 45104.395833333336 | 4.66 |
| 45104.40625 | 4.65 |
| 45104.416666666664 | 4.6 |
| 45104.427083333336 | 4.18 |
| 45104.4375 | 4.23 |
| 45104.447916666664 | 4.02 |
| 45104.458333333336 | 4.39 |
| 45104.46875 | 4.44 |
| 45104.479166666664 | 4.98 |
| 45104.489583333336 | 5.06 |
| 45104.5 | 5.3 |
| 45104.510416666664 | 4.53 |
| 45104.520833333336 | 3.59 |
| 45104.53125 | 3.34 |
| 45104.541666666664 | 3.09 |
| 45104.552083333336 | 3.26 |
| 45104.5625 | 3.58 |
| 45104.572916666664 | 4.17 |
| 45104.583333333336 | 3.91 |
| 45104.59375 | 4.18 |
| 45104.604166666664 | 5.83 |
| 45104.614583333336 | 5.57 |
| 45104.625 | 5 |
| 45104.635416666664 | 5.01 |
| 45104.645833333336 | 5.24 |
| 45104.65625 | 4.66 |
| 45104.666666666664 | 3.82 |
| 45104.677083333336 | 3.74 |
| 45104.6875 | 3.74 |
| 45104.697916666664 | 3.99 |
| 45104.708333333336 | 4.52 |
| 45104.71875 | 4.77 |
| 45104.729166666664 | 5.3 |
| 45104.739583333336 | 5.33 |
| 45104.75 | 5.43 |
| 45104.760416666664 | 5.62 |
| 45104.770833333336 | 5.4 |
| 45104.78125 | 5.74 |
| 45104.791666666664 | 5.52 |
| 45104.802083333336 | 6.34 |
| 45104.8125 | 5.99 |
| 45104.822916666664 | 5.93 |
| 45104.833333333336 | 6.23 |
| 45104.84375 | 6.73 |
| 45104.854166666664 | 6.92 |
| 45104.864583333336 | 7.27 |
| 45104.875 | 5.38 |
| 45104.885416666664 | 6.78 |
| 45104.895833333336 | 7.08 |
| 45104.90625 | 7.8 |
| 45104.916666666664 | 7.84 |
| 45104.927083333336 | 7.73 |
| 45104.9375 | 8.5 |
| 45104.947916666664 | 8.39 |
| 45104.958333333336 | 8.33 |
| 45104.96875 | 8.15 |
| 45104.979166666664 | 9.05 |
| 45104.989583333336 | 8.45 |
| 45105.0 | 8.06 |
| 45105.010416666664 | 8.15 |
| 45105.020833333336 | 8.27 |
| 45105.03125 | 8.92 |
| 45105.041666666664 | 8.87 |
| 45105.052083333336 | 8.48 |
| 45105.0625 | 8.16 |
| 45105.072916666664 | 8.06 |
| 45105.083333333336 | 7.83 |
| 45105.09375 | 9.34 |
| 45105.104166666664 | 8.36 |
| 45105.114583333336 | 7.57 |
| 45105.125 | 9.46 |
| 45105.135416666664 | 9.66 |
| 45105.145833333336 | 8.54 |
| 45105.15625 | 7.59 |
| 45105.166666666664 | 7.29 |
| 45105.177083333336 | 7.44 |
| 45105.1875 | 7.44 |
| 45105.197916666664 | 8 |
| 45105.208333333336 | 6.95 |
| 45105.21875 | 7.38 |
| 45105.229166666664 | 7.22 |
| 45105.239583333336 | 6.44 |
| 45105.25 | 7 |
| 45105.260416666664 | 6.97 |
| 45105.270833333336 | 7.17 |
| 45105.28125 | 5.82 |
| 45105.291666666664 | 6.23 |
| 45105.302083333336 | 6.53 |
| 45105.3125 | 6.24 |
| 45105.322916666664 | 6.14 |
| 45105.333333333336 | 6.27 |
| 45105.34375 | 6.58 |
| 45105.354166666664 | 6.51 |
| 45105.364583333336 | 6.58 |
| 45105.375 | 6.65 |
| 45105.385416666664 | 5.96 |
| 45105.395833333336 | 4.54 |
| 45105.40625 | 4.48 |
| 45105.416666666664 | 3.89 |
| 45105.427083333336 | 4.51 |
| 45105.4375 | 4.05 |
| 45105.447916666664 | 3.94 |
| 45105.458333333336 | 3.8 |
| 45105.46875 | 3.78 |
| 45105.479166666664 | 3.86 |
| 45105.489583333336 | 3.73 |
| 45105.5 | 3.56 |
| 45105.510416666664 | 3.83 |
| 45105.520833333336 | 3.82 |
| 45105.53125 | 3.95 |
| 45105.541666666664 | 4.14 |
| 45105.552083333336 | 4.32 |
| 45105.5625 | 4.14 |
| 45105.572916666664 | 4.62 |
| 45105.583333333336 | 4.81 |
| 45105.59375 | 5.09 |
| 45105.604166666664 | 5.64 |
| 45105.614583333336 | 5.36 |
| 45105.625 | 6.08 |
| 45105.635416666664 | 5.81 |
| 45105.645833333336 | 5.76 |
| 45105.65625 | 3.22 |
| 45105.666666666664 | 2.78 |
| 45105.677083333336 | 3.21 |
| 45105.6875 | 3.37 |
| 45105.697916666664 | 3.43 |
| 45105.708333333336 | 3.38 |
| 45105.71875 | 3.72 |
| 45105.729166666664 | 3.83 |
| 45105.739583333336 | 4.21 |
| 45105.75 | 4.13 |
| 45105.760416666664 | 4.66 |
| 45105.770833333336 | 4.77 |
| 45105.78125 | 5.36 |
| 45105.791666666664 | 5.42 |
| 45105.802083333336 | 5.83 |
| 45105.8125 | 5.97 |
| 45105.822916666664 | 5.84 |
| 45105.833333333336 | 5.9 |
| 45105.84375 | 6.12 |
| 45105.854166666664 | 5.83 |
| 45105.864583333336 | 5.3 |
| 45105.875 | 5.33 |
| 45105.885416666664 | 5.48 |
| 45105.895833333336 | 5.35 |
| 45105.90625 | 6.67 |
| 45105.916666666664 | 5.31 |
| 45105.927083333336 | 5.71 |
| 45105.9375 | 6.45 |
| 45105.947916666664 | 5.97 |
| 45105.958333333336 | 8.88 |
| 45105.96875 | 8.94 |
| 45105.979166666664 | 10.07 |
| 45105.989583333336 | 9.97 |
| 45106.0 | 9.53 |
| 45106.010416666664 | 10.48 |
| 45106.020833333336 | 10.72 |
| 45106.03125 | 10.21 |
| 45106.041666666664 | 9.84 |
| 45106.052083333336 | 9.45 |
| 45106.0625 | 9.12 |
| 45106.072916666664 | 8.97 |
| 45106.083333333336 | 8.75 |
| 45106.09375 | 8.78 |
| 45106.104166666664 | 8.39 |
| 45106.114583333336 | 8.5 |
| 45106.125 | 8 |
| 45106.135416666664 | 7.92 |
| 45106.145833333336 | 8.81 |
| 45106.15625 | 8.1 |
| 45106.166666666664 | 8.64 |
| 45106.177083333336 | 8.46 |
| 45106.1875 | 7.91 |
| 45106.197916666664 | 7.47 |
| 45106.208333333336 | 7.19 |
| 45106.21875 | 7.45 |
| 45106.229166666664 | 7.46 |
| 45106.239583333336 | 7.16 |
| 45106.25 | 6.36 |
| 45106.260416666664 | 6.57 |
| 45106.270833333336 | 6.56 |
| 45106.28125 | 6.33 |
| 45106.291666666664 | 6.37 |
| 45106.302083333336 | 6.4 |
| 45106.3125 | 5.93 |
| 45106.322916666664 | 5.84 |
| 45106.333333333336 | 5.72 |
| 45106.34375 | 4.99 |
| 45106.354166666664 | 5.34 |
| 45106.364583333336 | 5.04 |
| 45106.375 | 4.53 |
| 45106.385416666664 | 4.76 |
| 45106.395833333336 | 4.22 |
| 45106.40625 | 4.03 |
| 45106.416666666664 | 4.25 |
| 45106.427083333336 | 3.63 |
| 45106.4375 | 3.12 |
| 45106.447916666664 | 2.89 |
| 45106.458333333336 | 2.87 |
| 45106.46875 | 2.99 |
| 45106.479166666664 | 3.61 |
| 45106.489583333336 | 3.48 |
| 45106.5 | 3.64 |
| 45106.510416666664 | 3.33 |
| 45106.520833333336 | 3.42 |
| 45106.53125 | 3.57 |
| 45106.541666666664 | 4.05 |
| 45106.552083333336 | 4.09 |
| 45106.5625 | 4.12 |
| 45106.572916666664 | 4.68 |
| 45106.583333333336 | 4.59 |
| 45106.59375 | 4.39 |
| 45106.604166666664 | 5.07 |
| 45106.614583333336 | 5.7 |
| 45106.625 | 6.52 |
| 45106.635416666664 | 6.36 |
| 45106.645833333336 | 6.26 |
| 45106.65625 | 6.24 |
| 45106.666666666664 | 6.06 |
| 45106.677083333336 | 10.63 |
| 45106.6875 | 6.64 |
| 45106.697916666664 | 4.06 |
| 45106.708333333336 | 3.89 |
| 45106.71875 | 3.48 |
| 45106.729166666664 | 3.9 |
| 45106.739583333336 | 3.68 |
| 45106.75 | 3.78 |
| 45106.760416666664 | 4.11 |
| 45106.770833333336 | 4.81 |
| 45106.78125 | 4.9 |
| 45106.791666666664 | 4.82 |
| 45106.802083333336 | 5.18 |
| 45106.8125 | 5.69 |
| 45106.822916666664 | 5.92 |
| 45106.833333333336 | 6.01 |
| 45106.84375 | 6.77 |
| 45106.854166666664 | 7.28 |
| 45106.864583333336 | 6.93 |
| 45106.875 | 6.3 |
| 45106.885416666664 | 6.66 |
| 45106.895833333336 | 6.38 |
| 45106.90625 | 6.8 |
| 45106.916666666664 | 7.28 |
| 45106.927083333336 | 6.58 |
| 45106.9375 | 7.03 |
| 45106.947916666664 | 5.44 |
| 45106.958333333336 | 5.8 |
| 45106.96875 | 6.68 |
| 45106.979166666664 | 6.27 |
| 45106.989583333336 | 8.24 |
| 45107.0 | 8.55 |
| 45107.010416666664 | 8.5 |
| 45107.020833333336 | 8.23 |
| 45107.03125 | 8.64 |
| 45107.041666666664 | 9.05 |
| 45107.052083333336 | 8.59 |
| 45107.0625 | 8.78 |
| 45107.072916666664 | 8.66 |
| 45107.083333333336 | 8.79 |
| 45107.09375 | 8.15 |
| 45107.104166666664 | 8.16 |
| 45107.114583333336 | 8.16 |
| 45107.125 | 7.82 |
| 45107.135416666664 | 7.88 |
| 45107.145833333336 | 7.8 |
| 45107.15625 | 7.67 |
| 45107.166666666664 | 8 |
| 45107.177083333336 | 8.01 |
| 45107.1875 | 9.4 |
| 45107.197916666664 | 10.03 |
| 45107.208333333336 | 9.66 |
| 45107.21875 | 8.12 |
| 45107.229166666664 | 7.29 |
| 45107.239583333336 | 7.37 |
| 45107.25 | 6.6 |
| 45107.260416666664 | 6.68 |
| 45107.270833333336 | 6.3 |
| 45107.28125 | 6.29 |
| 45107.291666666664 | 5.93 |
| 45107.302083333336 | 5.54 |
| 45107.3125 | 5.84 |
| 45107.322916666664 | 5.66 |
| 45107.333333333336 | 5.55 |
| 45107.34375 | 5.14 |
| 45107.354166666664 | 5.31 |
| 45107.364583333336 | 4.6 |
| 45107.375 | 4.74 |
| 45107.385416666664 | 4.63 |
| 45107.395833333336 | 4.63 |
| 45107.40625 | 4.3 |
| 45107.416666666664 | 4.21 |
| 45107.427083333336 | 3.85 |
| 45107.4375 | 3.7 |
| 45107.447916666664 | 3.51 |
| 45107.458333333336 | 3.02 |
| 45107.46875 | 2.63 |
| 45107.479166666664 | 2.51 |
| 45107.489583333336 | 2.79 |
| 45107.5 | 2.61 |
| 45107.510416666664 | 2.99 |
| 45107.520833333336 | 3.4 |
| 45107.53125 | 3.02 |
| 45107.541666666664 | 2.99 |
| 45107.552083333336 | 3.23 |
| 45107.5625 | 3.14 |
| 45107.572916666664 | 3.47 |
| 45107.583333333336 | 3.55 |
| 45107.59375 | 3.94 |
| 45107.604166666664 | 4.88 |
| 45107.614583333336 | 5.45 |
| 45107.625 | 5.59 |
| 45107.635416666664 | 6.14 |
| 45107.645833333336 | 6.83 |
| 45107.65625 | 7.72 |
| 45107.666666666664 | 8.56 |
| 45107.677083333336 | 11.59 |
| 45107.6875 | 13.1 |
| 45107.697916666664 | 14.51 |
| 45107.708333333336 | 12.53 |
| 45107.71875 | 8.47 |
| 45107.729166666664 | 6.75 |
| 45107.739583333336 | 5.85 |
| 45107.75 | 4.81 |
| 45107.760416666664 | 4.74 |
| 45107.770833333336 | 4.47 |
| 45107.78125 | 4.65 |
| 45107.791666666664 | 5.03 |
| 45107.802083333336 | 4.9 |
| 45107.8125 | 4.87 |
| 45107.822916666664 | 5.02 |
| 45107.833333333336 | 4.91 |
| 45107.84375 | 4.99 |
| 45107.854166666664 | 5.02 |
| 45107.864583333336 | 5.61 |
| 45107.875 | 5.17 |
| 45107.885416666664 | 5.5 |
| 45107.895833333336 | 5.56 |
| 45107.90625 | 5.18 |
| 45107.916666666664 | 5.29 |
| 45107.927083333336 | 5.56 |
| 45107.9375 | 5.37 |
| 45107.947916666664 | 5.77 |
| 45107.958333333336 | 5.11 |
| 45107.96875 | 5.44 |
| 45107.979166666664 | 5.67 |
| 45107.989583333336 | 5.71 |
| 45108.0 | 5.56 |
| 45108.010416666664 | 5.2 |
| 45108.020833333336 | 5.01 |
| 45108.03125 | 5.73 |
| 45108.041666666664 | 5.9 |
| 45108.052083333336 | 5.87 |
| 45108.0625 | 5.37 |
| 45108.072916666664 | 6.15 |
| 45108.083333333336 | 5.97 |
| 45108.09375 | 5.59 |
| 45108.104166666664 | 5.88 |
| 45108.114583333336 | 5.2 |
| 45108.125 | 5.73 |
| 45108.135416666664 | 6.01 |
| 45108.145833333336 | 5.71 |
| 45108.15625 | 6.24 |
| 45108.166666666664 | 6.58 |
| 45108.177083333336 | 6.95 |
| 45108.1875 | 7.04 |
| 45108.197916666664 | 7.5 |
| 45108.208333333336 | 7.58 |
| 45108.21875 | 7.99 |
| 45108.229166666664 | 9.45 |
| 45108.239583333336 | 11.32 |
| 45108.25 | 9.9 |
| 45108.260416666664 | 6.93 |
| 45108.270833333336 | 6.45 |
| 45108.28125 | 6.18 |
| 45108.291666666664 | 5.66 |
| 45108.302083333336 | 5.99 |
| 45108.3125 | 5.26 |
| 45108.322916666664 | 5.06 |
| 45108.333333333336 | 4.46 |
| 45108.34375 | 4.65 |
| 45108.354166666664 | 4.43 |
| 45108.364583333336 | 4.29 |
| 45108.375 | 4.4 |
| 45108.385416666664 | 4.25 |
| 45108.395833333336 | 4.11 |
| 45108.40625 | 3.99 |
| 45108.416666666664 | 3.81 |
| 45108.427083333336 | 3.71 |
| 45108.4375 | 3.51 |
| 45108.447916666664 | 3.1 |
| 45108.458333333336 | 2.93 |
| 45108.46875 | 2.67 |
| 45108.479166666664 | 2.69 |
| 45108.489583333336 | 2.45 |
| 45108.5 | 2.08 |
| 45108.510416666664 | 2.52 |
| 45108.520833333336 | 2.28 |
| 45108.53125 | 2.72 |
| 45108.541666666664 | 3.1 |
| 45108.552083333336 | 3.17 |
| 45108.5625 | 3.08 |
| 45108.572916666664 | 3.12 |
| 45108.583333333336 | 3.2 |
| 45108.59375 | 2.97 |
| 45108.604166666664 | 3.38 |
| 45108.614583333336 | 3.61 |
| 45108.625 | 4.12 |
| 45108.635416666664 | 5.25 |
| 45108.645833333336 | 5.63 |
| 45108.65625 | 6.98 |
| 45108.666666666664 | 7.49 |
| 45108.677083333336 | 8.42 |
| 45108.6875 | 10.8 |
| 45108.697916666664 | 15.85 |
| 45108.708333333336 | 20.28 |
| 45108.71875 | 21.53 |
| 45108.729166666664 | 24.1 |
| 45108.739583333336 | 29.43 |
| 45108.75 | 28.07 |
| 45108.760416666664 | 17.75 |
| 45108.770833333336 | 13.53 |
| 45108.78125 | 12.04 |
| 45108.791666666664 | 9.2 |
| 45108.802083333336 | 8.12 |
| 45108.8125 | 7.57 |
| 45108.822916666664 | 6.97 |
| 45108.833333333336 | 7.07 |
| 45108.84375 | 6.63 |
| 45108.854166666664 | 6.57 |
| 45108.864583333336 | 6.59 |
| 45108.875 | 6.42 |
| 45108.885416666664 | 6.63 |
| 45108.895833333336 | 6.23 |
| 45108.90625 | 6.19 |
| 45108.916666666664 | 6.18 |
| 45108.927083333336 | 6.01 |
| 45108.9375 | 5.68 |
| 45108.947916666664 | 5.59 |
| 45108.958333333336 | 5.42 |
| 45108.96875 | 5.65 |
| 45108.979166666664 | 5.39 |
| 45108.989583333336 | 5.79 |
| 45109.0 | 5.75 |
| 45109.010416666664 | 5.29 |
| 45109.020833333336 | 5.29 |
| 45109.03125 | 5.18 |
| 45109.041666666664 | 5.43 |
| 45109.052083333336 | 5.24 |
| 45109.0625 | 5.68 |
| 45109.072916666664 | 5.92 |
| 45109.083333333336 | 5.85 |
| 45109.09375 | 5.76 |